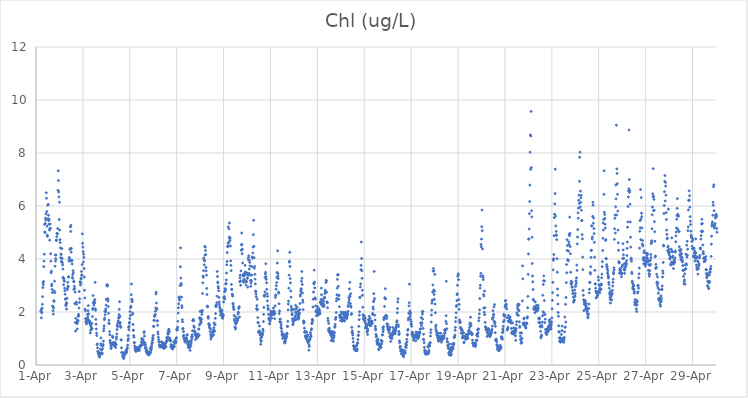
| Category | Chl (ug/L) |
|---|---|
| 44287.208333333336 | 2.02 |
| 44287.21875 | 2.05 |
| 44287.229166666664 | 1.78 |
| 44287.239583333336 | 2.12 |
| 44287.25 | 1.97 |
| 44287.260416666664 | 2.14 |
| 44287.270833333336 | 2.29 |
| 44287.28125 | 2.58 |
| 44287.291666666664 | 2.92 |
| 44287.302083333336 | 3.11 |
| 44287.3125 | 3.03 |
| 44287.322916666664 | 3.15 |
| 44287.333333333336 | 3.71 |
| 44287.34375 | 3.92 |
| 44287.354166666664 | 4.18 |
| 44287.364583333336 | 5.31 |
| 44287.375 | 5.02 |
| 44287.385416666664 | 5 |
| 44287.395833333336 | 5.34 |
| 44287.40625 | 5.54 |
| 44287.416666666664 | 5.47 |
| 44287.427083333336 | 5.7 |
| 44287.4375 | 6.5 |
| 44287.447916666664 | 6.29 |
| 44287.458333333336 | 5.79 |
| 44287.46875 | 5.24 |
| 44287.479166666664 | 4.9 |
| 44287.489583333336 | 4.85 |
| 44287.5 | 6.03 |
| 44287.510416666664 | 5.52 |
| 44287.520833333336 | 6.06 |
| 44287.53125 | 5.65 |
| 44287.541666666664 | 5.45 |
| 44287.552083333336 | 5.31 |
| 44287.5625 | 5.5 |
| 44287.572916666664 | 5.09 |
| 44287.583333333336 | 4.71 |
| 44287.59375 | 5.15 |
| 44287.604166666664 | 5.32 |
| 44287.614583333336 | 5.16 |
| 44287.625 | 4.2 |
| 44287.635416666664 | 3.92 |
| 44287.645833333336 | 3.48 |
| 44287.65625 | 3.54 |
| 44287.666666666664 | 2.99 |
| 44287.677083333336 | 3.05 |
| 44287.6875 | 2.85 |
| 44287.697916666664 | 2.73 |
| 44287.708333333336 | 2.22 |
| 44287.71875 | 2.21 |
| 44287.729166666664 | 2.05 |
| 44287.739583333336 | 1.92 |
| 44287.75 | 2.16 |
| 44287.760416666664 | 2.43 |
| 44287.770833333336 | 2.4 |
| 44287.78125 | 2.79 |
| 44287.791666666664 | 3.16 |
| 44287.802083333336 | 2.73 |
| 44287.8125 | 3.73 |
| 44287.822916666664 | 4.15 |
| 44287.833333333336 | 3.92 |
| 44287.84375 | 4.01 |
| 44287.854166666664 | 4.15 |
| 44287.864583333336 | 4.7 |
| 44287.875 | 4.71 |
| 44287.885416666664 | 4.84 |
| 44287.895833333336 | 4.97 |
| 44287.90625 | 4.96 |
| 44287.916666666664 | 4.95 |
| 44287.927083333336 | 5.15 |
| 44287.9375 | 6.59 |
| 44287.947916666664 | 7.33 |
| 44287.958333333336 | 6.96 |
| 44287.96875 | 6.53 |
| 44287.979166666664 | 6.34 |
| 44287.989583333336 | 5.49 |
| 44288.0 | 6.14 |
| 44288.010416666664 | 5.09 |
| 44288.020833333336 | 4.73 |
| 44288.03125 | 4.62 |
| 44288.041666666664 | 4.42 |
| 44288.052083333336 | 4.05 |
| 44288.0625 | 4.19 |
| 44288.072916666664 | 4.17 |
| 44288.083333333336 | 3.91 |
| 44288.09375 | 3.9 |
| 44288.104166666664 | 4.39 |
| 44288.114583333336 | 4.02 |
| 44288.125 | 3.86 |
| 44288.135416666664 | 3.78 |
| 44288.145833333336 | 3.62 |
| 44288.15625 | 3.31 |
| 44288.166666666664 | 3.27 |
| 44288.177083333336 | 3.03 |
| 44288.1875 | 3.26 |
| 44288.197916666664 | 3.2 |
| 44288.208333333336 | 3.16 |
| 44288.21875 | 2.9 |
| 44288.229166666664 | 2.8 |
| 44288.239583333336 | 2.67 |
| 44288.25 | 2.49 |
| 44288.260416666664 | 2.48 |
| 44288.270833333336 | 2.27 |
| 44288.28125 | 2.24 |
| 44288.291666666664 | 2.35 |
| 44288.302083333336 | 2.11 |
| 44288.3125 | 2.32 |
| 44288.322916666664 | 2.52 |
| 44288.333333333336 | 2.84 |
| 44288.34375 | 2.89 |
| 44288.354166666664 | 3.12 |
| 44288.364583333336 | 2.98 |
| 44288.375 | 2.96 |
| 44288.385416666664 | 3.32 |
| 44288.395833333336 | 3.33 |
| 44288.40625 | 3.94 |
| 44288.416666666664 | 4.06 |
| 44288.427083333336 | 3.92 |
| 44288.4375 | 4 |
| 44288.447916666664 | 4.36 |
| 44288.458333333336 | 4.39 |
| 44288.46875 | 5.21 |
| 44288.479166666664 | 5.04 |
| 44288.489583333336 | 5.27 |
| 44288.5 | 4.26 |
| 44288.510416666664 | 4.4 |
| 44288.520833333336 | 3.92 |
| 44288.53125 | 3.95 |
| 44288.541666666664 | 3.81 |
| 44288.552083333336 | 3.3 |
| 44288.5625 | 3.41 |
| 44288.572916666664 | 3.27 |
| 44288.583333333336 | 3.56 |
| 44288.59375 | 3.48 |
| 44288.604166666664 | 3.15 |
| 44288.614583333336 | 2.85 |
| 44288.625 | 3.15 |
| 44288.635416666664 | 2.97 |
| 44288.645833333336 | 2.89 |
| 44288.65625 | 2.31 |
| 44288.666666666664 | 2.75 |
| 44288.677083333336 | 1.6 |
| 44288.6875 | 1.28 |
| 44288.697916666664 | 1.76 |
| 44288.708333333336 | 2.36 |
| 44288.71875 | 2.37 |
| 44288.729166666664 | 2.29 |
| 44288.739583333336 | 1.61 |
| 44288.75 | 1.56 |
| 44288.760416666664 | 1.36 |
| 44288.770833333336 | 1.68 |
| 44288.78125 | 1.64 |
| 44288.791666666664 | 1.68 |
| 44288.802083333336 | 1.84 |
| 44288.8125 | 1.91 |
| 44288.822916666664 | 1.85 |
| 44288.833333333336 | 2.15 |
| 44288.84375 | 2.77 |
| 44288.854166666664 | 2.36 |
| 44288.864583333336 | 2.5 |
| 44288.875 | 3.13 |
| 44288.885416666664 | 3.14 |
| 44288.895833333336 | 3.02 |
| 44288.90625 | 3.1 |
| 44288.916666666664 | 3.25 |
| 44288.927083333336 | 3.27 |
| 44288.9375 | 3.53 |
| 44288.947916666664 | 3.39 |
| 44288.958333333336 | 3.39 |
| 44288.96875 | 3.79 |
| 44288.979166666664 | 4.95 |
| 44288.989583333336 | 4.59 |
| 44289.0 | 4.45 |
| 44289.010416666664 | 4.28 |
| 44289.020833333336 | 3.89 |
| 44289.03125 | 4.18 |
| 44289.041666666664 | 4.06 |
| 44289.052083333336 | 3.64 |
| 44289.0625 | 3.32 |
| 44289.072916666664 | 2.82 |
| 44289.083333333336 | 2.53 |
| 44289.09375 | 2.1 |
| 44289.104166666664 | 2.05 |
| 44289.114583333336 | 1.75 |
| 44289.125 | 1.62 |
| 44289.135416666664 | 1.74 |
| 44289.145833333336 | 1.68 |
| 44289.15625 | 1.55 |
| 44289.166666666664 | 1.63 |
| 44289.177083333336 | 1.68 |
| 44289.1875 | 1.91 |
| 44289.197916666664 | 1.74 |
| 44289.208333333336 | 1.81 |
| 44289.21875 | 2.05 |
| 44289.229166666664 | 2.24 |
| 44289.239583333336 | 1.93 |
| 44289.25 | 1.92 |
| 44289.260416666664 | 1.68 |
| 44289.270833333336 | 1.67 |
| 44289.28125 | 1.59 |
| 44289.291666666664 | 1.64 |
| 44289.302083333336 | 1.59 |
| 44289.3125 | 1.21 |
| 44289.322916666664 | 1.51 |
| 44289.333333333336 | 1.31 |
| 44289.34375 | 1.48 |
| 44289.354166666664 | 1.35 |
| 44289.364583333336 | 1.39 |
| 44289.375 | 1.4 |
| 44289.385416666664 | 1.57 |
| 44289.395833333336 | 1.37 |
| 44289.40625 | 1.83 |
| 44289.416666666664 | 2.1 |
| 44289.427083333336 | 2.14 |
| 44289.4375 | 2.62 |
| 44289.447916666664 | 2.33 |
| 44289.458333333336 | 2.36 |
| 44289.46875 | 2.26 |
| 44289.479166666664 | 2.41 |
| 44289.489583333336 | 2.37 |
| 44289.5 | 2.34 |
| 44289.510416666664 | 2.47 |
| 44289.520833333336 | 3.12 |
| 44289.53125 | 2.12 |
| 44289.541666666664 | 2.06 |
| 44289.552083333336 | 1.72 |
| 44289.5625 | 1.54 |
| 44289.572916666664 | 1.36 |
| 44289.583333333336 | 1.2 |
| 44289.59375 | 1.11 |
| 44289.604166666664 | 0.77 |
| 44289.614583333336 | 0.79 |
| 44289.625 | 0.65 |
| 44289.635416666664 | 0.52 |
| 44289.645833333336 | 0.5 |
| 44289.65625 | 0.43 |
| 44289.666666666664 | 0.48 |
| 44289.677083333336 | 0.48 |
| 44289.6875 | 0.34 |
| 44289.697916666664 | 0.37 |
| 44289.708333333336 | 0.3 |
| 44289.71875 | 0.35 |
| 44289.729166666664 | 0.39 |
| 44289.739583333336 | 0.44 |
| 44289.75 | 0.6 |
| 44289.760416666664 | 0.8 |
| 44289.770833333336 | 1.02 |
| 44289.78125 | 0.74 |
| 44289.791666666664 | 0.57 |
| 44289.802083333336 | 0.44 |
| 44289.8125 | 0.46 |
| 44289.822916666664 | 0.42 |
| 44289.833333333336 | 0.61 |
| 44289.84375 | 0.75 |
| 44289.854166666664 | 0.71 |
| 44289.864583333336 | 0.77 |
| 44289.875 | 0.9 |
| 44289.885416666664 | 1.29 |
| 44289.895833333336 | 1.38 |
| 44289.90625 | 1.48 |
| 44289.916666666664 | 1.71 |
| 44289.927083333336 | 1.77 |
| 44289.9375 | 2.03 |
| 44289.947916666664 | 1.9 |
| 44289.958333333336 | 2.05 |
| 44289.96875 | 2.01 |
| 44289.979166666664 | 2.12 |
| 44289.989583333336 | 2.26 |
| 44290.0 | 2.47 |
| 44290.010416666664 | 2.48 |
| 44290.020833333336 | 2.99 |
| 44290.03125 | 3.02 |
| 44290.041666666664 | 3.03 |
| 44290.052083333336 | 2.98 |
| 44290.0625 | 2.5 |
| 44290.072916666664 | 2.41 |
| 44290.083333333336 | 2.21 |
| 44290.09375 | 1.95 |
| 44290.104166666664 | 1.58 |
| 44290.114583333336 | 1.69 |
| 44290.125 | 1.56 |
| 44290.135416666664 | 1.26 |
| 44290.145833333336 | 1.14 |
| 44290.15625 | 0.93 |
| 44290.166666666664 | 0.86 |
| 44290.177083333336 | 0.82 |
| 44290.1875 | 0.74 |
| 44290.197916666664 | 0.62 |
| 44290.208333333336 | 0.66 |
| 44290.21875 | 0.78 |
| 44290.229166666664 | 0.74 |
| 44290.239583333336 | 0.83 |
| 44290.25 | 0.78 |
| 44290.260416666664 | 1.09 |
| 44290.270833333336 | 1.04 |
| 44290.28125 | 1.05 |
| 44290.291666666664 | 0.81 |
| 44290.302083333336 | 0.85 |
| 44290.3125 | 0.82 |
| 44290.322916666664 | 0.76 |
| 44290.333333333336 | 0.78 |
| 44290.34375 | 0.73 |
| 44290.354166666664 | 0.71 |
| 44290.364583333336 | 0.8 |
| 44290.375 | 0.86 |
| 44290.385416666664 | 0.79 |
| 44290.395833333336 | 0.66 |
| 44290.40625 | 0.77 |
| 44290.416666666664 | 0.77 |
| 44290.427083333336 | 0.98 |
| 44290.4375 | 1.06 |
| 44290.447916666664 | 1.17 |
| 44290.458333333336 | 1.34 |
| 44290.46875 | 1.5 |
| 44290.479166666664 | 1.45 |
| 44290.489583333336 | 1.57 |
| 44290.5 | 1.63 |
| 44290.510416666664 | 1.66 |
| 44290.520833333336 | 1.76 |
| 44290.53125 | 1.8 |
| 44290.541666666664 | 1.9 |
| 44290.552083333336 | 2.1 |
| 44290.5625 | 2.39 |
| 44290.572916666664 | 1.57 |
| 44290.583333333336 | 1.83 |
| 44290.59375 | 1.6 |
| 44290.604166666664 | 1.47 |
| 44290.614583333336 | 1.42 |
| 44290.625 | 0.95 |
| 44290.635416666664 | 0.94 |
| 44290.645833333336 | 0.65 |
| 44290.65625 | 0.46 |
| 44290.666666666664 | 0.48 |
| 44290.677083333336 | 0.47 |
| 44290.6875 | 0.47 |
| 44290.697916666664 | 0.35 |
| 44290.708333333336 | 0.31 |
| 44290.71875 | 0.36 |
| 44290.729166666664 | 0.33 |
| 44290.739583333336 | 0.24 |
| 44290.75 | 0.29 |
| 44290.760416666664 | 0.36 |
| 44290.770833333336 | 0.4 |
| 44290.78125 | 0.44 |
| 44290.791666666664 | 0.4 |
| 44290.802083333336 | 0.46 |
| 44290.8125 | 0.45 |
| 44290.822916666664 | 0.53 |
| 44290.833333333336 | 0.5 |
| 44290.84375 | 0.46 |
| 44290.854166666664 | 0.47 |
| 44290.864583333336 | 0.5 |
| 44290.875 | 0.57 |
| 44290.885416666664 | 0.62 |
| 44290.895833333336 | 0.66 |
| 44290.90625 | 0.75 |
| 44290.916666666664 | 0.92 |
| 44290.927083333336 | 1.11 |
| 44290.9375 | 0.99 |
| 44290.947916666664 | 1.42 |
| 44290.958333333336 | 1.33 |
| 44290.96875 | 1.46 |
| 44290.979166666664 | 1.58 |
| 44290.989583333336 | 1.61 |
| 44291.0 | 1.75 |
| 44291.010416666664 | 2.02 |
| 44291.020833333336 | 1.87 |
| 44291.03125 | 2.17 |
| 44291.041666666664 | 2.18 |
| 44291.052083333336 | 2.22 |
| 44291.0625 | 2.65 |
| 44291.072916666664 | 3.06 |
| 44291.083333333336 | 2.48 |
| 44291.09375 | 2.39 |
| 44291.104166666664 | 2.45 |
| 44291.114583333336 | 1.91 |
| 44291.125 | 1.96 |
| 44291.135416666664 | 1.53 |
| 44291.145833333336 | 1.31 |
| 44291.15625 | 1.31 |
| 44291.166666666664 | 1.11 |
| 44291.177083333336 | 1.05 |
| 44291.1875 | 0.84 |
| 44291.197916666664 | 0.85 |
| 44291.208333333336 | 0.72 |
| 44291.21875 | 0.64 |
| 44291.229166666664 | 0.58 |
| 44291.239583333336 | 0.56 |
| 44291.25 | 0.57 |
| 44291.260416666664 | 0.51 |
| 44291.270833333336 | 0.64 |
| 44291.28125 | 0.59 |
| 44291.291666666664 | 0.66 |
| 44291.302083333336 | 0.55 |
| 44291.3125 | 0.63 |
| 44291.322916666664 | 0.6 |
| 44291.333333333336 | 0.62 |
| 44291.34375 | 0.55 |
| 44291.354166666664 | 0.62 |
| 44291.364583333336 | 0.61 |
| 44291.375 | 0.67 |
| 44291.385416666664 | 0.55 |
| 44291.395833333336 | 0.59 |
| 44291.40625 | 0.55 |
| 44291.416666666664 | 0.65 |
| 44291.427083333336 | 0.68 |
| 44291.4375 | 0.7 |
| 44291.447916666664 | 0.73 |
| 44291.458333333336 | 0.72 |
| 44291.46875 | 0.72 |
| 44291.479166666664 | 0.72 |
| 44291.489583333336 | 0.77 |
| 44291.5 | 0.86 |
| 44291.510416666664 | 1 |
| 44291.520833333336 | 0.94 |
| 44291.53125 | 0.9 |
| 44291.541666666664 | 0.97 |
| 44291.552083333336 | 0.77 |
| 44291.5625 | 0.85 |
| 44291.572916666664 | 0.96 |
| 44291.583333333336 | 0.86 |
| 44291.59375 | 0.86 |
| 44291.604166666664 | 1.21 |
| 44291.614583333336 | 1.26 |
| 44291.625 | 1.09 |
| 44291.635416666664 | 0.85 |
| 44291.645833333336 | 0.74 |
| 44291.65625 | 0.63 |
| 44291.666666666664 | 0.78 |
| 44291.677083333336 | 0.66 |
| 44291.6875 | 0.66 |
| 44291.697916666664 | 0.52 |
| 44291.708333333336 | 0.55 |
| 44291.71875 | 0.48 |
| 44291.729166666664 | 0.57 |
| 44291.739583333336 | 0.44 |
| 44291.75 | 0.5 |
| 44291.760416666664 | 0.43 |
| 44291.770833333336 | 0.46 |
| 44291.78125 | 0.49 |
| 44291.791666666664 | 0.39 |
| 44291.802083333336 | 0.41 |
| 44291.8125 | 0.38 |
| 44291.822916666664 | 0.47 |
| 44291.833333333336 | 0.48 |
| 44291.84375 | 0.42 |
| 44291.854166666664 | 0.47 |
| 44291.864583333336 | 0.44 |
| 44291.875 | 0.65 |
| 44291.885416666664 | 0.49 |
| 44291.895833333336 | 0.58 |
| 44291.90625 | 0.57 |
| 44291.916666666664 | 0.61 |
| 44291.927083333336 | 0.67 |
| 44291.9375 | 0.75 |
| 44291.947916666664 | 0.82 |
| 44291.958333333336 | 0.85 |
| 44291.96875 | 0.93 |
| 44291.979166666664 | 1.04 |
| 44291.989583333336 | 1 |
| 44292.0 | 1.12 |
| 44292.010416666664 | 1.46 |
| 44292.020833333336 | 1.45 |
| 44292.03125 | 1.68 |
| 44292.041666666664 | 1.69 |
| 44292.052083333336 | 1.85 |
| 44292.0625 | 1.84 |
| 44292.072916666664 | 1.86 |
| 44292.083333333336 | 1.91 |
| 44292.09375 | 2.03 |
| 44292.104166666664 | 2.15 |
| 44292.114583333336 | 2.68 |
| 44292.125 | 2.74 |
| 44292.135416666664 | 2.34 |
| 44292.145833333336 | 2.14 |
| 44292.15625 | 2.1 |
| 44292.166666666664 | 1.66 |
| 44292.177083333336 | 1.67 |
| 44292.1875 | 1.5 |
| 44292.197916666664 | 1.25 |
| 44292.208333333336 | 1.17 |
| 44292.21875 | 1.05 |
| 44292.229166666664 | 0.96 |
| 44292.239583333336 | 0.87 |
| 44292.25 | 0.87 |
| 44292.260416666664 | 0.76 |
| 44292.270833333336 | 0.73 |
| 44292.28125 | 0.68 |
| 44292.291666666664 | 0.73 |
| 44292.302083333336 | 0.71 |
| 44292.3125 | 0.69 |
| 44292.322916666664 | 0.68 |
| 44292.333333333336 | 0.74 |
| 44292.34375 | 0.73 |
| 44292.354166666664 | 0.88 |
| 44292.364583333336 | 0.85 |
| 44292.375 | 0.72 |
| 44292.385416666664 | 0.78 |
| 44292.395833333336 | 0.68 |
| 44292.40625 | 0.72 |
| 44292.416666666664 | 0.66 |
| 44292.427083333336 | 0.74 |
| 44292.4375 | 0.83 |
| 44292.447916666664 | 0.81 |
| 44292.458333333336 | 0.63 |
| 44292.46875 | 0.63 |
| 44292.479166666664 | 0.69 |
| 44292.489583333336 | 0.79 |
| 44292.5 | 0.7 |
| 44292.510416666664 | 0.7 |
| 44292.520833333336 | 0.81 |
| 44292.53125 | 0.68 |
| 44292.541666666664 | 0.71 |
| 44292.552083333336 | 0.86 |
| 44292.5625 | 0.91 |
| 44292.572916666664 | 1.02 |
| 44292.583333333336 | 1.03 |
| 44292.59375 | 0.92 |
| 44292.604166666664 | 0.93 |
| 44292.614583333336 | 1.18 |
| 44292.625 | 1.06 |
| 44292.635416666664 | 1.24 |
| 44292.645833333336 | 1.17 |
| 44292.65625 | 1.31 |
| 44292.666666666664 | 1.35 |
| 44292.677083333336 | 1.27 |
| 44292.6875 | 1.26 |
| 44292.697916666664 | 0.98 |
| 44292.708333333336 | 1.01 |
| 44292.71875 | 0.95 |
| 44292.729166666664 | 0.9 |
| 44292.739583333336 | 0.92 |
| 44292.75 | 0.68 |
| 44292.760416666664 | 0.77 |
| 44292.770833333336 | 0.71 |
| 44292.78125 | 0.71 |
| 44292.791666666664 | 0.72 |
| 44292.802083333336 | 0.68 |
| 44292.8125 | 0.63 |
| 44292.822916666664 | 0.6 |
| 44292.833333333336 | 0.65 |
| 44292.84375 | 0.65 |
| 44292.854166666664 | 0.75 |
| 44292.864583333336 | 0.73 |
| 44292.875 | 0.86 |
| 44292.885416666664 | 0.71 |
| 44292.895833333336 | 0.69 |
| 44292.90625 | 0.86 |
| 44292.916666666664 | 0.88 |
| 44292.927083333336 | 0.93 |
| 44292.9375 | 0.89 |
| 44292.947916666664 | 0.82 |
| 44292.958333333336 | 0.87 |
| 44292.96875 | 0.88 |
| 44292.979166666664 | 1.01 |
| 44292.989583333336 | 1.03 |
| 44293.0 | 1.33 |
| 44293.010416666664 | 1.36 |
| 44293.020833333336 | 1.32 |
| 44293.03125 | 1.34 |
| 44293.041666666664 | 1.43 |
| 44293.052083333336 | 1.65 |
| 44293.0625 | 1.96 |
| 44293.072916666664 | 2.16 |
| 44293.083333333336 | 2.31 |
| 44293.09375 | 2.55 |
| 44293.104166666664 | 2.53 |
| 44293.114583333336 | 2.57 |
| 44293.125 | 2.46 |
| 44293.135416666664 | 2.45 |
| 44293.145833333336 | 3 |
| 44293.15625 | 3.71 |
| 44293.166666666664 | 4.42 |
| 44293.177083333336 | 3.28 |
| 44293.1875 | 3.08 |
| 44293.197916666664 | 3.02 |
| 44293.208333333336 | 2.56 |
| 44293.21875 | 2.24 |
| 44293.229166666664 | 2.17 |
| 44293.239583333336 | 1.71 |
| 44293.25 | 1.63 |
| 44293.260416666664 | 1.36 |
| 44293.270833333336 | 1.38 |
| 44293.28125 | 1.09 |
| 44293.291666666664 | 1.26 |
| 44293.302083333336 | 1.12 |
| 44293.3125 | 1.02 |
| 44293.322916666664 | 1 |
| 44293.333333333336 | 0.97 |
| 44293.34375 | 0.91 |
| 44293.354166666664 | 0.91 |
| 44293.364583333336 | 0.86 |
| 44293.375 | 0.92 |
| 44293.385416666664 | 0.9 |
| 44293.395833333336 | 0.95 |
| 44293.40625 | 1.03 |
| 44293.416666666664 | 0.96 |
| 44293.427083333336 | 0.98 |
| 44293.4375 | 1.12 |
| 44293.447916666664 | 1.15 |
| 44293.458333333336 | 0.89 |
| 44293.46875 | 0.8 |
| 44293.479166666664 | 0.77 |
| 44293.489583333336 | 0.67 |
| 44293.5 | 0.77 |
| 44293.510416666664 | 0.85 |
| 44293.520833333336 | 0.65 |
| 44293.53125 | 0.76 |
| 44293.541666666664 | 0.89 |
| 44293.552083333336 | 0.69 |
| 44293.5625 | 0.66 |
| 44293.572916666664 | 0.55 |
| 44293.583333333336 | 0.77 |
| 44293.59375 | 0.9 |
| 44293.604166666664 | 0.73 |
| 44293.614583333336 | 0.83 |
| 44293.625 | 0.9 |
| 44293.635416666664 | 1.06 |
| 44293.645833333336 | 0.99 |
| 44293.65625 | 1.14 |
| 44293.666666666664 | 1.07 |
| 44293.677083333336 | 1.29 |
| 44293.6875 | 1.68 |
| 44293.697916666664 | 1.68 |
| 44293.708333333336 | 1.72 |
| 44293.71875 | 1.67 |
| 44293.729166666664 | 1.47 |
| 44293.739583333336 | 1.29 |
| 44293.75 | 1.42 |
| 44293.760416666664 | 1.26 |
| 44293.770833333336 | 1.28 |
| 44293.78125 | 1.16 |
| 44293.791666666664 | 1.13 |
| 44293.802083333336 | 0.96 |
| 44293.8125 | 1.19 |
| 44293.822916666664 | 1.17 |
| 44293.833333333336 | 1.06 |
| 44293.84375 | 1.06 |
| 44293.854166666664 | 1.14 |
| 44293.864583333336 | 1.03 |
| 44293.875 | 1.1 |
| 44293.885416666664 | 1.03 |
| 44293.895833333336 | 1.11 |
| 44293.90625 | 1.17 |
| 44293.916666666664 | 1.16 |
| 44293.927083333336 | 1.1 |
| 44293.9375 | 1.35 |
| 44293.947916666664 | 1.36 |
| 44293.958333333336 | 1.12 |
| 44293.96875 | 1.78 |
| 44293.979166666664 | 1.51 |
| 44293.989583333336 | 1.55 |
| 44294.0 | 2.02 |
| 44294.010416666664 | 1.71 |
| 44294.020833333336 | 1.77 |
| 44294.03125 | 1.65 |
| 44294.041666666664 | 1.6 |
| 44294.052083333336 | 2.03 |
| 44294.0625 | 1.72 |
| 44294.072916666664 | 1.91 |
| 44294.083333333336 | 2 |
| 44294.09375 | 2.06 |
| 44294.104166666664 | 2.7 |
| 44294.114583333336 | 3.1 |
| 44294.125 | 3.36 |
| 44294.135416666664 | 3.31 |
| 44294.145833333336 | 3.56 |
| 44294.15625 | 4.04 |
| 44294.166666666664 | 3.98 |
| 44294.177083333336 | 3.78 |
| 44294.1875 | 3.93 |
| 44294.197916666664 | 4.47 |
| 44294.208333333336 | 4.15 |
| 44294.21875 | 4.45 |
| 44294.229166666664 | 4.32 |
| 44294.239583333336 | 4.17 |
| 44294.25 | 3.68 |
| 44294.260416666664 | 3.55 |
| 44294.270833333336 | 3.39 |
| 44294.28125 | 2.89 |
| 44294.291666666664 | 2.66 |
| 44294.302083333336 | 2.22 |
| 44294.3125 | 2.21 |
| 44294.322916666664 | 2.19 |
| 44294.333333333336 | 1.82 |
| 44294.34375 | 1.76 |
| 44294.354166666664 | 1.82 |
| 44294.364583333336 | 1.56 |
| 44294.375 | 1.54 |
| 44294.385416666664 | 1.48 |
| 44294.395833333336 | 1.43 |
| 44294.40625 | 1.52 |
| 44294.416666666664 | 1.37 |
| 44294.427083333336 | 1.26 |
| 44294.4375 | 1.37 |
| 44294.447916666664 | 1.15 |
| 44294.458333333336 | 0.98 |
| 44294.46875 | 1.07 |
| 44294.479166666664 | 1.1 |
| 44294.489583333336 | 1.07 |
| 44294.5 | 1.08 |
| 44294.510416666664 | 1.13 |
| 44294.520833333336 | 1.11 |
| 44294.53125 | 1.24 |
| 44294.541666666664 | 1.23 |
| 44294.552083333336 | 1.3 |
| 44294.5625 | 1.33 |
| 44294.572916666664 | 1.14 |
| 44294.583333333336 | 1.41 |
| 44294.59375 | 1.59 |
| 44294.604166666664 | 1.26 |
| 44294.614583333336 | 1.3 |
| 44294.625 | 1.53 |
| 44294.635416666664 | 1.52 |
| 44294.645833333336 | 1.76 |
| 44294.65625 | 1.94 |
| 44294.666666666664 | 2.23 |
| 44294.677083333336 | 2.2 |
| 44294.6875 | 2.26 |
| 44294.697916666664 | 2.25 |
| 44294.708333333336 | 2.35 |
| 44294.71875 | 2.6 |
| 44294.729166666664 | 3.53 |
| 44294.739583333336 | 3.34 |
| 44294.75 | 3.13 |
| 44294.760416666664 | 3.1 |
| 44294.770833333336 | 2.96 |
| 44294.78125 | 2.9 |
| 44294.791666666664 | 2.8 |
| 44294.802083333336 | 2.55 |
| 44294.8125 | 2.38 |
| 44294.822916666664 | 2.29 |
| 44294.833333333336 | 2.2 |
| 44294.84375 | 2.14 |
| 44294.854166666664 | 2.05 |
| 44294.864583333336 | 2.03 |
| 44294.875 | 1.88 |
| 44294.885416666664 | 1.97 |
| 44294.895833333336 | 1.9 |
| 44294.90625 | 2 |
| 44294.916666666664 | 2.07 |
| 44294.927083333336 | 2.05 |
| 44294.9375 | 1.9 |
| 44294.947916666664 | 1.81 |
| 44294.958333333336 | 1.76 |
| 44294.96875 | 1.92 |
| 44294.979166666664 | 1.84 |
| 44294.989583333336 | 1.88 |
| 44295.0 | 2.38 |
| 44295.010416666664 | 2.53 |
| 44295.020833333336 | 2.56 |
| 44295.03125 | 2.58 |
| 44295.041666666664 | 2.76 |
| 44295.052083333336 | 2.49 |
| 44295.0625 | 2.88 |
| 44295.072916666664 | 2.8 |
| 44295.083333333336 | 2.87 |
| 44295.09375 | 3.05 |
| 44295.104166666664 | 3.08 |
| 44295.114583333336 | 3.21 |
| 44295.125 | 3.47 |
| 44295.135416666664 | 3.78 |
| 44295.145833333336 | 3.91 |
| 44295.15625 | 4.24 |
| 44295.166666666664 | 4.47 |
| 44295.177083333336 | 4.47 |
| 44295.1875 | 4.6 |
| 44295.197916666664 | 5.21 |
| 44295.208333333336 | 4.5 |
| 44295.21875 | 4.62 |
| 44295.229166666664 | 5.14 |
| 44295.239583333336 | 4.83 |
| 44295.25 | 5.36 |
| 44295.260416666664 | 4.77 |
| 44295.270833333336 | 4.69 |
| 44295.28125 | 4.79 |
| 44295.291666666664 | 4.49 |
| 44295.302083333336 | 3.93 |
| 44295.3125 | 3.76 |
| 44295.322916666664 | 3.56 |
| 44295.333333333336 | 3.04 |
| 44295.34375 | 2.85 |
| 44295.354166666664 | 2.86 |
| 44295.364583333336 | 2.68 |
| 44295.375 | 2.65 |
| 44295.385416666664 | 2.6 |
| 44295.395833333336 | 2.32 |
| 44295.40625 | 2.3 |
| 44295.416666666664 | 2.21 |
| 44295.427083333336 | 2.15 |
| 44295.4375 | 2.09 |
| 44295.447916666664 | 1.87 |
| 44295.458333333336 | 1.73 |
| 44295.46875 | 1.67 |
| 44295.479166666664 | 1.43 |
| 44295.489583333336 | 1.61 |
| 44295.5 | 1.43 |
| 44295.510416666664 | 1.36 |
| 44295.520833333336 | 1.55 |
| 44295.53125 | 1.81 |
| 44295.541666666664 | 1.62 |
| 44295.552083333336 | 1.58 |
| 44295.5625 | 1.63 |
| 44295.572916666664 | 1.73 |
| 44295.583333333336 | 1.67 |
| 44295.59375 | 1.69 |
| 44295.604166666664 | 1.74 |
| 44295.614583333336 | 1.92 |
| 44295.625 | 1.99 |
| 44295.635416666664 | 1.98 |
| 44295.645833333336 | 2.13 |
| 44295.65625 | 2.18 |
| 44295.666666666664 | 2.2 |
| 44295.677083333336 | 1.81 |
| 44295.6875 | 3.14 |
| 44295.697916666664 | 3.29 |
| 44295.708333333336 | 3.39 |
| 44295.71875 | 3.17 |
| 44295.729166666664 | 3.01 |
| 44295.739583333336 | 3.55 |
| 44295.75 | 4.33 |
| 44295.760416666664 | 4.53 |
| 44295.770833333336 | 4.98 |
| 44295.78125 | 4.55 |
| 44295.791666666664 | 4.2 |
| 44295.802083333336 | 4.37 |
| 44295.8125 | 3.85 |
| 44295.822916666664 | 3.37 |
| 44295.833333333336 | 3.17 |
| 44295.84375 | 3.42 |
| 44295.854166666664 | 3.12 |
| 44295.864583333336 | 3.24 |
| 44295.875 | 3.36 |
| 44295.885416666664 | 3.43 |
| 44295.895833333336 | 3.46 |
| 44295.90625 | 3.41 |
| 44295.916666666664 | 3.76 |
| 44295.927083333336 | 3.51 |
| 44295.9375 | 3.18 |
| 44295.947916666664 | 3.14 |
| 44295.958333333336 | 3.02 |
| 44295.96875 | 3.16 |
| 44295.979166666664 | 3.14 |
| 44295.989583333336 | 3.45 |
| 44296.0 | 3.28 |
| 44296.010416666664 | 3.47 |
| 44296.020833333336 | 3.27 |
| 44296.03125 | 2.94 |
| 44296.041666666664 | 3.38 |
| 44296.052083333336 | 4.05 |
| 44296.0625 | 3.97 |
| 44296.072916666664 | 4.12 |
| 44296.083333333336 | 3.46 |
| 44296.09375 | 3.62 |
| 44296.104166666664 | 3.95 |
| 44296.114583333336 | 3.87 |
| 44296.125 | 3.74 |
| 44296.135416666664 | 3.39 |
| 44296.145833333336 | 3.19 |
| 44296.15625 | 2.97 |
| 44296.166666666664 | 3.09 |
| 44296.177083333336 | 3.19 |
| 44296.1875 | 3.17 |
| 44296.197916666664 | 3.4 |
| 44296.208333333336 | 3.71 |
| 44296.21875 | 4.08 |
| 44296.229166666664 | 4.04 |
| 44296.239583333336 | 4.04 |
| 44296.25 | 4.23 |
| 44296.260416666664 | 4.45 |
| 44296.270833333336 | 4.92 |
| 44296.28125 | 5.46 |
| 44296.291666666664 | 4.48 |
| 44296.302083333336 | 4.05 |
| 44296.3125 | 3.65 |
| 44296.322916666664 | 3.72 |
| 44296.333333333336 | 3.42 |
| 44296.34375 | 3.24 |
| 44296.354166666664 | 3.06 |
| 44296.364583333336 | 2.79 |
| 44296.375 | 2.76 |
| 44296.385416666664 | 2.67 |
| 44296.395833333336 | 2.57 |
| 44296.40625 | 2.13 |
| 44296.416666666664 | 2.24 |
| 44296.427083333336 | 2.08 |
| 44296.4375 | 2.48 |
| 44296.447916666664 | 2.1 |
| 44296.458333333336 | 1.79 |
| 44296.46875 | 1.61 |
| 44296.479166666664 | 1.59 |
| 44296.489583333336 | 1.24 |
| 44296.5 | 1.25 |
| 44296.510416666664 | 1.28 |
| 44296.520833333336 | 1.28 |
| 44296.53125 | 1.47 |
| 44296.541666666664 | 1.27 |
| 44296.552083333336 | 1.14 |
| 44296.5625 | 1.2 |
| 44296.572916666664 | 1 |
| 44296.583333333336 | 0.78 |
| 44296.59375 | 0.89 |
| 44296.604166666664 | 0.92 |
| 44296.614583333336 | 1.06 |
| 44296.625 | 1.06 |
| 44296.635416666664 | 1.19 |
| 44296.645833333336 | 1.18 |
| 44296.65625 | 1.13 |
| 44296.666666666664 | 1.18 |
| 44296.677083333336 | 1.35 |
| 44296.6875 | 1.28 |
| 44296.697916666664 | 1.64 |
| 44296.708333333336 | 1.91 |
| 44296.71875 | 2.17 |
| 44296.729166666664 | 2.62 |
| 44296.739583333336 | 2.59 |
| 44296.75 | 2.64 |
| 44296.760416666664 | 2.76 |
| 44296.770833333336 | 3.3 |
| 44296.78125 | 3.43 |
| 44296.791666666664 | 3.5 |
| 44296.802083333336 | 3.82 |
| 44296.8125 | 3.33 |
| 44296.822916666664 | 3.23 |
| 44296.833333333336 | 3.1 |
| 44296.84375 | 2.86 |
| 44296.854166666664 | 2.69 |
| 44296.864583333336 | 2.42 |
| 44296.875 | 2.59 |
| 44296.885416666664 | 2.24 |
| 44296.895833333336 | 2.14 |
| 44296.90625 | 2.09 |
| 44296.916666666664 | 1.91 |
| 44296.927083333336 | 1.77 |
| 44296.9375 | 1.73 |
| 44296.947916666664 | 1.7 |
| 44296.958333333336 | 1.56 |
| 44296.96875 | 1.56 |
| 44296.979166666664 | 1.73 |
| 44296.989583333336 | 1.66 |
| 44297.0 | 1.94 |
| 44297.010416666664 | 1.85 |
| 44297.020833333336 | 2.03 |
| 44297.03125 | 2 |
| 44297.041666666664 | 1.93 |
| 44297.052083333336 | 1.77 |
| 44297.0625 | 1.89 |
| 44297.072916666664 | 1.96 |
| 44297.083333333336 | 1.97 |
| 44297.09375 | 2.02 |
| 44297.104166666664 | 1.97 |
| 44297.114583333336 | 1.91 |
| 44297.125 | 2.15 |
| 44297.135416666664 | 1.99 |
| 44297.145833333336 | 1.9 |
| 44297.15625 | 2.03 |
| 44297.166666666664 | 2 |
| 44297.177083333336 | 1.75 |
| 44297.1875 | 1.94 |
| 44297.197916666664 | 2.23 |
| 44297.208333333336 | 2.55 |
| 44297.21875 | 2.62 |
| 44297.229166666664 | 2.64 |
| 44297.239583333336 | 2.86 |
| 44297.25 | 2.99 |
| 44297.260416666664 | 3.11 |
| 44297.270833333336 | 3.3 |
| 44297.28125 | 3.49 |
| 44297.291666666664 | 3.85 |
| 44297.302083333336 | 4.31 |
| 44297.3125 | 3.45 |
| 44297.322916666664 | 3.36 |
| 44297.333333333336 | 3.26 |
| 44297.34375 | 2.75 |
| 44297.354166666664 | 2.71 |
| 44297.364583333336 | 2.31 |
| 44297.375 | 1.94 |
| 44297.385416666664 | 2.04 |
| 44297.395833333336 | 1.63 |
| 44297.40625 | 1.73 |
| 44297.416666666664 | 1.73 |
| 44297.427083333336 | 1.62 |
| 44297.4375 | 1.6 |
| 44297.447916666664 | 1.43 |
| 44297.458333333336 | 1.51 |
| 44297.46875 | 1.37 |
| 44297.479166666664 | 1.26 |
| 44297.489583333336 | 1.16 |
| 44297.5 | 1.14 |
| 44297.510416666664 | 1.11 |
| 44297.520833333336 | 1 |
| 44297.53125 | 1.18 |
| 44297.541666666664 | 1.14 |
| 44297.552083333336 | 1.1 |
| 44297.5625 | 1.04 |
| 44297.572916666664 | 1.14 |
| 44297.583333333336 | 1.09 |
| 44297.59375 | 0.88 |
| 44297.604166666664 | 0.84 |
| 44297.614583333336 | 0.83 |
| 44297.625 | 1.01 |
| 44297.635416666664 | 0.89 |
| 44297.645833333336 | 0.96 |
| 44297.65625 | 1.03 |
| 44297.666666666664 | 1.02 |
| 44297.677083333336 | 1.13 |
| 44297.6875 | 1.07 |
| 44297.697916666664 | 1.2 |
| 44297.708333333336 | 1.18 |
| 44297.71875 | 1.46 |
| 44297.729166666664 | 1.45 |
| 44297.739583333336 | 1.65 |
| 44297.75 | 2.08 |
| 44297.760416666664 | 2.3 |
| 44297.770833333336 | 2.41 |
| 44297.78125 | 2.9 |
| 44297.791666666664 | 3.39 |
| 44297.802083333336 | 3.88 |
| 44297.8125 | 3.92 |
| 44297.822916666664 | 4.25 |
| 44297.833333333336 | 3.72 |
| 44297.84375 | 3.26 |
| 44297.854166666664 | 3.1 |
| 44297.864583333336 | 2.79 |
| 44297.875 | 2.56 |
| 44297.885416666664 | 2.21 |
| 44297.895833333336 | 2.06 |
| 44297.90625 | 2.13 |
| 44297.916666666664 | 1.9 |
| 44297.927083333336 | 1.94 |
| 44297.9375 | 1.75 |
| 44297.947916666664 | 1.66 |
| 44297.958333333336 | 1.52 |
| 44297.96875 | 1.58 |
| 44297.979166666664 | 1.66 |
| 44297.989583333336 | 2.09 |
| 44298.0 | 1.71 |
| 44298.010416666664 | 1.68 |
| 44298.020833333336 | 1.68 |
| 44298.03125 | 1.71 |
| 44298.041666666664 | 1.81 |
| 44298.052083333336 | 1.86 |
| 44298.0625 | 1.99 |
| 44298.072916666664 | 2.25 |
| 44298.083333333336 | 2.12 |
| 44298.09375 | 2.11 |
| 44298.104166666664 | 1.72 |
| 44298.114583333336 | 1.75 |
| 44298.125 | 1.93 |
| 44298.135416666664 | 2.18 |
| 44298.145833333336 | 2 |
| 44298.15625 | 1.86 |
| 44298.166666666664 | 1.98 |
| 44298.177083333336 | 1.8 |
| 44298.1875 | 1.9 |
| 44298.197916666664 | 1.73 |
| 44298.208333333336 | 2.05 |
| 44298.21875 | 1.81 |
| 44298.229166666664 | 1.91 |
| 44298.239583333336 | 1.96 |
| 44298.25 | 2.09 |
| 44298.260416666664 | 2.32 |
| 44298.270833333336 | 2.6 |
| 44298.28125 | 2.66 |
| 44298.291666666664 | 2.78 |
| 44298.302083333336 | 2.84 |
| 44298.3125 | 2.88 |
| 44298.322916666664 | 3.16 |
| 44298.333333333336 | 3.53 |
| 44298.34375 | 3.27 |
| 44298.354166666664 | 3.04 |
| 44298.364583333336 | 2.72 |
| 44298.375 | 2.45 |
| 44298.385416666664 | 2.37 |
| 44298.395833333336 | 2.09 |
| 44298.40625 | 1.66 |
| 44298.416666666664 | 1.58 |
| 44298.427083333336 | 1.64 |
| 44298.4375 | 1.61 |
| 44298.447916666664 | 1.39 |
| 44298.458333333336 | 1.24 |
| 44298.46875 | 1.27 |
| 44298.479166666664 | 1.23 |
| 44298.489583333336 | 1.1 |
| 44298.5 | 1.05 |
| 44298.510416666664 | 1.06 |
| 44298.520833333336 | 0.99 |
| 44298.53125 | 1.09 |
| 44298.541666666664 | 1.25 |
| 44298.552083333336 | 1.04 |
| 44298.5625 | 0.91 |
| 44298.572916666664 | 1.13 |
| 44298.583333333336 | 1.13 |
| 44298.59375 | 1.1 |
| 44298.604166666664 | 0.84 |
| 44298.614583333336 | 0.94 |
| 44298.625 | 0.86 |
| 44298.635416666664 | 0.56 |
| 44298.645833333336 | 0.76 |
| 44298.65625 | 0.7 |
| 44298.666666666664 | 0.96 |
| 44298.677083333336 | 0.94 |
| 44298.6875 | 0.99 |
| 44298.697916666664 | 1.22 |
| 44298.708333333336 | 1.07 |
| 44298.71875 | 1.15 |
| 44298.729166666664 | 1.08 |
| 44298.739583333336 | 1.32 |
| 44298.75 | 1.37 |
| 44298.760416666664 | 1.58 |
| 44298.770833333336 | 1.56 |
| 44298.78125 | 1.7 |
| 44298.791666666664 | 1.72 |
| 44298.802083333336 | 1.65 |
| 44298.8125 | 2.19 |
| 44298.822916666664 | 2.48 |
| 44298.833333333336 | 2.75 |
| 44298.84375 | 3.08 |
| 44298.854166666664 | 3.06 |
| 44298.864583333336 | 3.58 |
| 44298.875 | 3.13 |
| 44298.885416666664 | 2.91 |
| 44298.895833333336 | 2.53 |
| 44298.90625 | 2.52 |
| 44298.916666666664 | 2.49 |
| 44298.927083333336 | 2.23 |
| 44298.9375 | 2.04 |
| 44298.947916666664 | 2.01 |
| 44298.958333333336 | 1.86 |
| 44298.96875 | 2.02 |
| 44298.979166666664 | 1.97 |
| 44298.989583333336 | 2.07 |
| 44299.0 | 2.11 |
| 44299.010416666664 | 2.2 |
| 44299.020833333336 | 1.99 |
| 44299.03125 | 2.08 |
| 44299.041666666664 | 1.89 |
| 44299.052083333336 | 1.9 |
| 44299.0625 | 1.95 |
| 44299.072916666664 | 2.12 |
| 44299.083333333336 | 1.95 |
| 44299.09375 | 1.97 |
| 44299.104166666664 | 2.05 |
| 44299.114583333336 | 1.94 |
| 44299.125 | 2.38 |
| 44299.135416666664 | 2.37 |
| 44299.145833333336 | 2.31 |
| 44299.15625 | 2.47 |
| 44299.166666666664 | 2.9 |
| 44299.177083333336 | 2.65 |
| 44299.1875 | 2.37 |
| 44299.197916666664 | 2.29 |
| 44299.208333333336 | 2.24 |
| 44299.21875 | 2.24 |
| 44299.229166666664 | 2.48 |
| 44299.239583333336 | 2.41 |
| 44299.25 | 2.21 |
| 44299.260416666664 | 2.29 |
| 44299.270833333336 | 2.4 |
| 44299.28125 | 2.27 |
| 44299.291666666664 | 2.22 |
| 44299.302083333336 | 2.56 |
| 44299.3125 | 2.53 |
| 44299.322916666664 | 2.7 |
| 44299.333333333336 | 2.82 |
| 44299.34375 | 2.75 |
| 44299.354166666664 | 2.75 |
| 44299.364583333336 | 3.11 |
| 44299.375 | 3.2 |
| 44299.385416666664 | 3.17 |
| 44299.395833333336 | 2.75 |
| 44299.40625 | 2.38 |
| 44299.416666666664 | 2.37 |
| 44299.427083333336 | 2.35 |
| 44299.4375 | 2.16 |
| 44299.447916666664 | 1.76 |
| 44299.458333333336 | 1.67 |
| 44299.46875 | 1.34 |
| 44299.479166666664 | 1.57 |
| 44299.489583333336 | 1.26 |
| 44299.5 | 1.29 |
| 44299.510416666664 | 1.39 |
| 44299.520833333336 | 1.26 |
| 44299.53125 | 1.3 |
| 44299.541666666664 | 1.21 |
| 44299.552083333336 | 1.2 |
| 44299.5625 | 1.14 |
| 44299.572916666664 | 1.23 |
| 44299.583333333336 | 1.26 |
| 44299.59375 | 0.92 |
| 44299.604166666664 | 1.09 |
| 44299.614583333336 | 0.94 |
| 44299.625 | 1.05 |
| 44299.635416666664 | 1.16 |
| 44299.645833333336 | 1.11 |
| 44299.65625 | 1.19 |
| 44299.666666666664 | 0.99 |
| 44299.677083333336 | 1.26 |
| 44299.6875 | 0.9 |
| 44299.697916666664 | 1.03 |
| 44299.708333333336 | 1.2 |
| 44299.71875 | 1.1 |
| 44299.729166666664 | 1.22 |
| 44299.739583333336 | 1.42 |
| 44299.75 | 1.45 |
| 44299.760416666664 | 1.53 |
| 44299.770833333336 | 1.72 |
| 44299.78125 | 1.79 |
| 44299.791666666664 | 1.79 |
| 44299.802083333336 | 1.98 |
| 44299.8125 | 2.42 |
| 44299.822916666664 | 2.51 |
| 44299.833333333336 | 2.65 |
| 44299.84375 | 2.9 |
| 44299.854166666664 | 3.23 |
| 44299.864583333336 | 3.39 |
| 44299.875 | 3.41 |
| 44299.885416666664 | 3.41 |
| 44299.895833333336 | 2.97 |
| 44299.90625 | 2.61 |
| 44299.916666666664 | 2.48 |
| 44299.927083333336 | 2.63 |
| 44299.9375 | 2.2 |
| 44299.947916666664 | 1.88 |
| 44299.958333333336 | 1.85 |
| 44299.96875 | 1.8 |
| 44299.979166666664 | 1.8 |
| 44299.989583333336 | 1.68 |
| 44300.0 | 1.8 |
| 44300.010416666664 | 1.91 |
| 44300.020833333336 | 2 |
| 44300.03125 | 1.67 |
| 44300.041666666664 | 1.74 |
| 44300.052083333336 | 1.79 |
| 44300.0625 | 1.65 |
| 44300.072916666664 | 1.73 |
| 44300.083333333336 | 1.72 |
| 44300.09375 | 1.7 |
| 44300.104166666664 | 1.93 |
| 44300.114583333336 | 1.99 |
| 44300.125 | 1.97 |
| 44300.135416666664 | 1.85 |
| 44300.145833333336 | 1.68 |
| 44300.15625 | 1.66 |
| 44300.166666666664 | 1.78 |
| 44300.177083333336 | 1.94 |
| 44300.1875 | 1.99 |
| 44300.197916666664 | 1.78 |
| 44300.208333333336 | 1.79 |
| 44300.21875 | 1.89 |
| 44300.229166666664 | 1.82 |
| 44300.239583333336 | 1.78 |
| 44300.25 | 1.75 |
| 44300.260416666664 | 1.8 |
| 44300.270833333336 | 1.92 |
| 44300.28125 | 1.96 |
| 44300.291666666664 | 1.88 |
| 44300.302083333336 | 2.03 |
| 44300.3125 | 2.21 |
| 44300.322916666664 | 2.25 |
| 44300.333333333336 | 2.36 |
| 44300.34375 | 2.53 |
| 44300.354166666664 | 2.45 |
| 44300.364583333336 | 2.87 |
| 44300.375 | 2.61 |
| 44300.385416666664 | 3.12 |
| 44300.395833333336 | 2.59 |
| 44300.40625 | 2.32 |
| 44300.416666666664 | 2.69 |
| 44300.427083333336 | 2.23 |
| 44300.4375 | 2.18 |
| 44300.447916666664 | 1.91 |
| 44300.458333333336 | 1.94 |
| 44300.46875 | 1.42 |
| 44300.479166666664 | 1.22 |
| 44300.489583333336 | 1.29 |
| 44300.5 | 1.2 |
| 44300.510416666664 | 1.13 |
| 44300.520833333336 | 1 |
| 44300.53125 | 0.87 |
| 44300.541666666664 | 0.73 |
| 44300.552083333336 | 0.71 |
| 44300.5625 | 0.61 |
| 44300.572916666664 | 0.7 |
| 44300.583333333336 | 0.68 |
| 44300.59375 | 0.58 |
| 44300.604166666664 | 0.62 |
| 44300.614583333336 | 0.58 |
| 44300.625 | 0.55 |
| 44300.635416666664 | 0.54 |
| 44300.645833333336 | 0.59 |
| 44300.65625 | 0.73 |
| 44300.666666666664 | 0.57 |
| 44300.677083333336 | 0.72 |
| 44300.6875 | 0.54 |
| 44300.697916666664 | 0.6 |
| 44300.708333333336 | 0.81 |
| 44300.71875 | 0.84 |
| 44300.729166666664 | 0.96 |
| 44300.739583333336 | 1.11 |
| 44300.75 | 1.13 |
| 44300.760416666664 | 1.25 |
| 44300.770833333336 | 1.46 |
| 44300.78125 | 1.71 |
| 44300.791666666664 | 1.88 |
| 44300.802083333336 | 2.01 |
| 44300.8125 | 2.54 |
| 44300.822916666664 | 2.57 |
| 44300.833333333336 | 2.95 |
| 44300.84375 | 3.06 |
| 44300.854166666664 | 3.6 |
| 44300.864583333336 | 3.76 |
| 44300.875 | 4.64 |
| 44300.885416666664 | 4.02 |
| 44300.895833333336 | 3.56 |
| 44300.90625 | 3.27 |
| 44300.916666666664 | 2.82 |
| 44300.927083333336 | 2.63 |
| 44300.9375 | 2.18 |
| 44300.947916666664 | 1.9 |
| 44300.958333333336 | 1.74 |
| 44300.96875 | 1.75 |
| 44300.979166666664 | 1.83 |
| 44300.989583333336 | 1.7 |
| 44301.0 | 1.86 |
| 44301.010416666664 | 1.75 |
| 44301.020833333336 | 1.68 |
| 44301.03125 | 1.63 |
| 44301.041666666664 | 1.77 |
| 44301.052083333336 | 1.4 |
| 44301.0625 | 1.56 |
| 44301.072916666664 | 1.42 |
| 44301.083333333336 | 1.45 |
| 44301.09375 | 1.49 |
| 44301.104166666664 | 1.43 |
| 44301.114583333336 | 1.25 |
| 44301.125 | 1.25 |
| 44301.135416666664 | 1.36 |
| 44301.145833333336 | 1.15 |
| 44301.15625 | 1.32 |
| 44301.166666666664 | 1.52 |
| 44301.177083333336 | 1.71 |
| 44301.1875 | 1.59 |
| 44301.197916666664 | 1.71 |
| 44301.208333333336 | 1.84 |
| 44301.21875 | 1.65 |
| 44301.229166666664 | 1.66 |
| 44301.239583333336 | 1.49 |
| 44301.25 | 1.77 |
| 44301.260416666664 | 1.52 |
| 44301.270833333336 | 1.48 |
| 44301.28125 | 1.63 |
| 44301.291666666664 | 1.58 |
| 44301.302083333336 | 1.64 |
| 44301.3125 | 1.66 |
| 44301.322916666664 | 1.64 |
| 44301.333333333336 | 1.63 |
| 44301.34375 | 1.56 |
| 44301.354166666664 | 1.95 |
| 44301.364583333336 | 1.9 |
| 44301.375 | 2.19 |
| 44301.385416666664 | 2.11 |
| 44301.395833333336 | 2.39 |
| 44301.40625 | 2.69 |
| 44301.416666666664 | 2.43 |
| 44301.427083333336 | 3.53 |
| 44301.4375 | 2.51 |
| 44301.447916666664 | 1.88 |
| 44301.458333333336 | 1.7 |
| 44301.46875 | 1.46 |
| 44301.479166666664 | 1.38 |
| 44301.489583333336 | 1.32 |
| 44301.5 | 1.15 |
| 44301.510416666664 | 1.06 |
| 44301.520833333336 | 1.09 |
| 44301.53125 | 0.91 |
| 44301.541666666664 | 0.83 |
| 44301.552083333336 | 0.78 |
| 44301.5625 | 0.95 |
| 44301.572916666664 | 0.91 |
| 44301.583333333336 | 0.83 |
| 44301.59375 | 0.97 |
| 44301.604166666664 | 0.79 |
| 44301.614583333336 | 0.6 |
| 44301.625 | 0.57 |
| 44301.635416666664 | 0.8 |
| 44301.645833333336 | 0.74 |
| 44301.65625 | 0.7 |
| 44301.666666666664 | 0.75 |
| 44301.677083333336 | 0.7 |
| 44301.6875 | 0.74 |
| 44301.697916666664 | 0.66 |
| 44301.708333333336 | 0.66 |
| 44301.71875 | 0.77 |
| 44301.729166666664 | 0.93 |
| 44301.739583333336 | 0.81 |
| 44301.75 | 0.9 |
| 44301.760416666664 | 0.89 |
| 44301.770833333336 | 1.13 |
| 44301.78125 | 1.14 |
| 44301.791666666664 | 1.4 |
| 44301.802083333336 | 1.26 |
| 44301.8125 | 1.34 |
| 44301.822916666664 | 1.45 |
| 44301.833333333336 | 1.71 |
| 44301.84375 | 1.79 |
| 44301.854166666664 | 1.79 |
| 44301.864583333336 | 2.21 |
| 44301.875 | 2.54 |
| 44301.885416666664 | 2.52 |
| 44301.895833333336 | 2.88 |
| 44301.90625 | 2.49 |
| 44301.916666666664 | 1.87 |
| 44301.927083333336 | 1.87 |
| 44301.9375 | 1.81 |
| 44301.947916666664 | 1.75 |
| 44301.958333333336 | 1.84 |
| 44301.96875 | 1.56 |
| 44301.979166666664 | 1.53 |
| 44301.989583333336 | 1.44 |
| 44302.0 | 1.52 |
| 44302.010416666664 | 1.35 |
| 44302.020833333336 | 1.38 |
| 44302.03125 | 1.33 |
| 44302.041666666664 | 1.3 |
| 44302.052083333336 | 1.23 |
| 44302.0625 | 1.39 |
| 44302.072916666664 | 1.33 |
| 44302.083333333336 | 1.43 |
| 44302.09375 | 1.08 |
| 44302.104166666664 | 1.03 |
| 44302.114583333336 | 1.13 |
| 44302.125 | 0.89 |
| 44302.135416666664 | 1.18 |
| 44302.145833333336 | 1.02 |
| 44302.15625 | 1.04 |
| 44302.166666666664 | 1.15 |
| 44302.177083333336 | 1 |
| 44302.1875 | 1.11 |
| 44302.197916666664 | 1.11 |
| 44302.208333333336 | 1.42 |
| 44302.21875 | 1.22 |
| 44302.229166666664 | 1.25 |
| 44302.239583333336 | 1.2 |
| 44302.25 | 1.3 |
| 44302.260416666664 | 1.2 |
| 44302.270833333336 | 1.25 |
| 44302.28125 | 1.34 |
| 44302.291666666664 | 1.18 |
| 44302.302083333336 | 1.2 |
| 44302.3125 | 1.37 |
| 44302.322916666664 | 1.19 |
| 44302.333333333336 | 1.28 |
| 44302.34375 | 1.36 |
| 44302.354166666664 | 1.41 |
| 44302.364583333336 | 1.45 |
| 44302.375 | 1.51 |
| 44302.385416666664 | 1.62 |
| 44302.395833333336 | 1.67 |
| 44302.40625 | 1.97 |
| 44302.416666666664 | 2.13 |
| 44302.427083333336 | 2.38 |
| 44302.4375 | 2.5 |
| 44302.447916666664 | 1.52 |
| 44302.458333333336 | 1.45 |
| 44302.46875 | 1.27 |
| 44302.479166666664 | 1.15 |
| 44302.489583333336 | 1.2 |
| 44302.5 | 0.91 |
| 44302.510416666664 | 0.84 |
| 44302.520833333336 | 0.68 |
| 44302.53125 | 0.63 |
| 44302.541666666664 | 0.7 |
| 44302.552083333336 | 0.53 |
| 44302.5625 | 0.53 |
| 44302.572916666664 | 0.56 |
| 44302.583333333336 | 0.42 |
| 44302.59375 | 0.54 |
| 44302.604166666664 | 0.45 |
| 44302.614583333336 | 0.52 |
| 44302.625 | 0.53 |
| 44302.635416666664 | 0.58 |
| 44302.645833333336 | 0.36 |
| 44302.65625 | 0.53 |
| 44302.666666666664 | 0.34 |
| 44302.677083333336 | 0.31 |
| 44302.6875 | 0.5 |
| 44302.697916666664 | 0.47 |
| 44302.708333333336 | 0.43 |
| 44302.71875 | 0.48 |
| 44302.729166666664 | 0.46 |
| 44302.739583333336 | 0.54 |
| 44302.75 | 0.45 |
| 44302.760416666664 | 0.69 |
| 44302.770833333336 | 0.8 |
| 44302.78125 | 0.79 |
| 44302.791666666664 | 0.66 |
| 44302.802083333336 | 0.75 |
| 44302.8125 | 0.97 |
| 44302.822916666664 | 0.87 |
| 44302.833333333336 | 1.13 |
| 44302.84375 | 1.15 |
| 44302.854166666664 | 1.31 |
| 44302.864583333336 | 1.34 |
| 44302.875 | 1.7 |
| 44302.885416666664 | 1.77 |
| 44302.895833333336 | 1.96 |
| 44302.90625 | 2.23 |
| 44302.916666666664 | 2.35 |
| 44302.927083333336 | 3.05 |
| 44302.9375 | 1.93 |
| 44302.947916666664 | 2.04 |
| 44302.958333333336 | 1.84 |
| 44302.96875 | 1.73 |
| 44302.979166666664 | 1.95 |
| 44302.989583333336 | 1.54 |
| 44303.0 | 1.64 |
| 44303.010416666664 | 1.55 |
| 44303.020833333336 | 1.46 |
| 44303.03125 | 1.16 |
| 44303.041666666664 | 1.24 |
| 44303.052083333336 | 1.21 |
| 44303.0625 | 1.1 |
| 44303.072916666664 | 1.21 |
| 44303.083333333336 | 1.11 |
| 44303.09375 | 1.04 |
| 44303.104166666664 | 0.93 |
| 44303.114583333336 | 0.99 |
| 44303.125 | 1.03 |
| 44303.135416666664 | 1.02 |
| 44303.145833333336 | 1.1 |
| 44303.15625 | 1.07 |
| 44303.166666666664 | 1.07 |
| 44303.177083333336 | 1.14 |
| 44303.1875 | 1.1 |
| 44303.197916666664 | 0.91 |
| 44303.208333333336 | 1.25 |
| 44303.21875 | 1.1 |
| 44303.229166666664 | 1.16 |
| 44303.239583333336 | 1.11 |
| 44303.25 | 1.06 |
| 44303.260416666664 | 1.14 |
| 44303.270833333336 | 1 |
| 44303.28125 | 1.21 |
| 44303.291666666664 | 1 |
| 44303.302083333336 | 1.23 |
| 44303.3125 | 1.04 |
| 44303.322916666664 | 1.09 |
| 44303.333333333336 | 1.1 |
| 44303.34375 | 1.19 |
| 44303.354166666664 | 1.18 |
| 44303.364583333336 | 1.24 |
| 44303.375 | 1.22 |
| 44303.385416666664 | 1.36 |
| 44303.395833333336 | 1.36 |
| 44303.40625 | 1.58 |
| 44303.416666666664 | 1.58 |
| 44303.427083333336 | 1.79 |
| 44303.4375 | 1.48 |
| 44303.447916666664 | 1.6 |
| 44303.458333333336 | 1.57 |
| 44303.46875 | 2.01 |
| 44303.479166666664 | 1.92 |
| 44303.489583333336 | 1.73 |
| 44303.5 | 2.02 |
| 44303.510416666664 | 1.38 |
| 44303.520833333336 | 0.97 |
| 44303.53125 | 1.16 |
| 44303.541666666664 | 0.95 |
| 44303.552083333336 | 0.84 |
| 44303.5625 | 0.67 |
| 44303.572916666664 | 0.56 |
| 44303.583333333336 | 0.49 |
| 44303.59375 | 0.46 |
| 44303.604166666664 | 0.54 |
| 44303.614583333336 | 0.41 |
| 44303.625 | 0.5 |
| 44303.635416666664 | 0.42 |
| 44303.645833333336 | 0.41 |
| 44303.65625 | 0.44 |
| 44303.666666666664 | 0.47 |
| 44303.677083333336 | 0.46 |
| 44303.6875 | 0.43 |
| 44303.697916666664 | 0.42 |
| 44303.708333333336 | 0.45 |
| 44303.71875 | 0.71 |
| 44303.729166666664 | 0.67 |
| 44303.739583333336 | 0.5 |
| 44303.75 | 0.44 |
| 44303.760416666664 | 0.55 |
| 44303.770833333336 | 0.78 |
| 44303.78125 | 0.73 |
| 44303.791666666664 | 0.72 |
| 44303.802083333336 | 0.84 |
| 44303.8125 | 0.84 |
| 44303.822916666664 | 1.09 |
| 44303.833333333336 | 1.22 |
| 44303.84375 | 1.33 |
| 44303.854166666664 | 1.62 |
| 44303.864583333336 | 1.89 |
| 44303.875 | 2.07 |
| 44303.885416666664 | 2.33 |
| 44303.895833333336 | 2.42 |
| 44303.90625 | 2.45 |
| 44303.916666666664 | 2.75 |
| 44303.927083333336 | 3.02 |
| 44303.9375 | 3.54 |
| 44303.947916666664 | 3.64 |
| 44303.958333333336 | 2.83 |
| 44303.96875 | 3.55 |
| 44303.979166666664 | 2.66 |
| 44303.989583333336 | 2.48 |
| 44304.0 | 2.79 |
| 44304.010416666664 | 3.42 |
| 44304.020833333336 | 2.3 |
| 44304.03125 | 1.97 |
| 44304.041666666664 | 1.44 |
| 44304.052083333336 | 1.35 |
| 44304.0625 | 1.51 |
| 44304.072916666664 | 1.27 |
| 44304.083333333336 | 1.27 |
| 44304.09375 | 1.13 |
| 44304.104166666664 | 1.19 |
| 44304.114583333336 | 1.14 |
| 44304.125 | 1.1 |
| 44304.135416666664 | 1.04 |
| 44304.145833333336 | 1.02 |
| 44304.15625 | 0.96 |
| 44304.166666666664 | 0.9 |
| 44304.177083333336 | 1.03 |
| 44304.1875 | 1.2 |
| 44304.197916666664 | 1.07 |
| 44304.208333333336 | 0.93 |
| 44304.21875 | 1.07 |
| 44304.229166666664 | 1.01 |
| 44304.239583333336 | 0.95 |
| 44304.25 | 1.06 |
| 44304.260416666664 | 1.2 |
| 44304.270833333336 | 1.04 |
| 44304.28125 | 0.99 |
| 44304.291666666664 | 0.86 |
| 44304.302083333336 | 0.96 |
| 44304.3125 | 0.94 |
| 44304.322916666664 | 1.09 |
| 44304.333333333336 | 1.1 |
| 44304.34375 | 1 |
| 44304.354166666664 | 0.97 |
| 44304.364583333336 | 1.02 |
| 44304.375 | 1.03 |
| 44304.385416666664 | 1.03 |
| 44304.395833333336 | 1.04 |
| 44304.40625 | 1.1 |
| 44304.416666666664 | 1.19 |
| 44304.427083333336 | 1.33 |
| 44304.4375 | 1.3 |
| 44304.447916666664 | 1.21 |
| 44304.458333333336 | 1.3 |
| 44304.46875 | 1.33 |
| 44304.479166666664 | 1.65 |
| 44304.489583333336 | 1.86 |
| 44304.5 | 3.16 |
| 44304.510416666664 | 1.56 |
| 44304.520833333336 | 1.37 |
| 44304.53125 | 0.99 |
| 44304.541666666664 | 0.89 |
| 44304.552083333336 | 0.87 |
| 44304.5625 | 0.75 |
| 44304.572916666664 | 0.71 |
| 44304.583333333336 | 0.64 |
| 44304.59375 | 0.62 |
| 44304.604166666664 | 0.46 |
| 44304.614583333336 | 0.39 |
| 44304.625 | 0.48 |
| 44304.635416666664 | 0.79 |
| 44304.645833333336 | 0.58 |
| 44304.65625 | 0.48 |
| 44304.666666666664 | 0.48 |
| 44304.677083333336 | 0.36 |
| 44304.6875 | 0.66 |
| 44304.697916666664 | 0.49 |
| 44304.708333333336 | 0.52 |
| 44304.71875 | 0.4 |
| 44304.729166666664 | 0.6 |
| 44304.739583333336 | 0.56 |
| 44304.75 | 0.79 |
| 44304.760416666664 | 0.65 |
| 44304.770833333336 | 0.62 |
| 44304.78125 | 0.7 |
| 44304.791666666664 | 0.63 |
| 44304.802083333336 | 0.81 |
| 44304.8125 | 0.77 |
| 44304.822916666664 | 0.81 |
| 44304.833333333336 | 1.04 |
| 44304.84375 | 1.04 |
| 44304.854166666664 | 1.08 |
| 44304.864583333336 | 1.13 |
| 44304.875 | 1.31 |
| 44304.885416666664 | 1.42 |
| 44304.895833333336 | 1.64 |
| 44304.90625 | 1.79 |
| 44304.916666666664 | 1.97 |
| 44304.927083333336 | 2.21 |
| 44304.9375 | 2.25 |
| 44304.947916666664 | 2.43 |
| 44304.958333333336 | 2.65 |
| 44304.96875 | 2.69 |
| 44304.979166666664 | 3.01 |
| 44304.989583333336 | 3.35 |
| 44305.0 | 3.38 |
| 44305.010416666664 | 3.44 |
| 44305.020833333336 | 3.22 |
| 44305.03125 | 2.47 |
| 44305.041666666664 | 2.1 |
| 44305.052083333336 | 2.29 |
| 44305.0625 | 1.7 |
| 44305.072916666664 | 1.62 |
| 44305.083333333336 | 1.59 |
| 44305.09375 | 1.63 |
| 44305.104166666664 | 1.42 |
| 44305.114583333336 | 1.38 |
| 44305.125 | 1.2 |
| 44305.135416666664 | 1.39 |
| 44305.145833333336 | 1.31 |
| 44305.15625 | 1.35 |
| 44305.166666666664 | 1.2 |
| 44305.177083333336 | 1.03 |
| 44305.1875 | 1.29 |
| 44305.197916666664 | 1.03 |
| 44305.208333333336 | 1.1 |
| 44305.21875 | 1.09 |
| 44305.229166666664 | 1.09 |
| 44305.239583333336 | 1.21 |
| 44305.25 | 0.84 |
| 44305.260416666664 | 0.87 |
| 44305.270833333336 | 1.01 |
| 44305.28125 | 1.06 |
| 44305.291666666664 | 1.05 |
| 44305.302083333336 | 1.06 |
| 44305.3125 | 1.05 |
| 44305.322916666664 | 1.07 |
| 44305.333333333336 | 1.02 |
| 44305.34375 | 0.97 |
| 44305.354166666664 | 1.15 |
| 44305.364583333336 | 1.11 |
| 44305.375 | 1.15 |
| 44305.385416666664 | 1.14 |
| 44305.395833333336 | 1.06 |
| 44305.40625 | 1.03 |
| 44305.416666666664 | 1 |
| 44305.427083333336 | 1.16 |
| 44305.4375 | 1.16 |
| 44305.447916666664 | 1.27 |
| 44305.458333333336 | 1.2 |
| 44305.46875 | 1.3 |
| 44305.479166666664 | 1.3 |
| 44305.489583333336 | 1.41 |
| 44305.5 | 1.53 |
| 44305.510416666664 | 1.59 |
| 44305.520833333336 | 1.51 |
| 44305.53125 | 1.8 |
| 44305.541666666664 | 1.56 |
| 44305.552083333336 | 1.48 |
| 44305.5625 | 1.23 |
| 44305.572916666664 | 1.17 |
| 44305.583333333336 | 1.15 |
| 44305.59375 | 1.19 |
| 44305.604166666664 | 1.16 |
| 44305.614583333336 | 0.94 |
| 44305.625 | 0.83 |
| 44305.635416666664 | 0.83 |
| 44305.645833333336 | 0.79 |
| 44305.65625 | 0.72 |
| 44305.666666666664 | 0.78 |
| 44305.677083333336 | 0.78 |
| 44305.6875 | 0.79 |
| 44305.697916666664 | 0.8 |
| 44305.708333333336 | 0.78 |
| 44305.71875 | 0.82 |
| 44305.729166666664 | 0.81 |
| 44305.739583333336 | 0.7 |
| 44305.75 | 0.72 |
| 44305.760416666664 | 0.79 |
| 44305.770833333336 | 0.91 |
| 44305.78125 | 0.94 |
| 44305.791666666664 | 1.12 |
| 44305.802083333336 | 0.93 |
| 44305.8125 | 1.16 |
| 44305.822916666664 | 1.33 |
| 44305.833333333336 | 1.18 |
| 44305.84375 | 1.08 |
| 44305.854166666664 | 1.22 |
| 44305.864583333336 | 1.36 |
| 44305.875 | 1.35 |
| 44305.885416666664 | 1.67 |
| 44305.895833333336 | 1.78 |
| 44305.90625 | 1.93 |
| 44305.916666666664 | 2.08 |
| 44305.927083333336 | 2.51 |
| 44305.9375 | 2.9 |
| 44305.947916666664 | 3.01 |
| 44305.958333333336 | 3.35 |
| 44305.96875 | 3.46 |
| 44305.979166666664 | 4.55 |
| 44305.989583333336 | 4.46 |
| 44306.0 | 4.75 |
| 44306.010416666664 | 5.22 |
| 44306.020833333336 | 5.85 |
| 44306.03125 | 5.07 |
| 44306.041666666664 | 4.38 |
| 44306.052083333336 | 3.37 |
| 44306.0625 | 3.3 |
| 44306.072916666664 | 3.22 |
| 44306.083333333336 | 2.66 |
| 44306.09375 | 2.15 |
| 44306.104166666664 | 2.6 |
| 44306.114583333336 | 1.99 |
| 44306.125 | 2.79 |
| 44306.135416666664 | 1.9 |
| 44306.145833333336 | 2.16 |
| 44306.15625 | 1.61 |
| 44306.166666666664 | 1.44 |
| 44306.177083333336 | 1.43 |
| 44306.1875 | 1.33 |
| 44306.197916666664 | 1.36 |
| 44306.208333333336 | 1.39 |
| 44306.21875 | 1.36 |
| 44306.229166666664 | 1.3 |
| 44306.239583333336 | 1.08 |
| 44306.25 | 1.23 |
| 44306.260416666664 | 1.19 |
| 44306.270833333336 | 1.32 |
| 44306.28125 | 1.35 |
| 44306.291666666664 | 1.19 |
| 44306.302083333336 | 1.37 |
| 44306.3125 | 1.12 |
| 44306.322916666664 | 1.13 |
| 44306.333333333336 | 1.3 |
| 44306.34375 | 1.2 |
| 44306.354166666664 | 1.18 |
| 44306.364583333336 | 1.07 |
| 44306.375 | 1.19 |
| 44306.385416666664 | 1.12 |
| 44306.395833333336 | 1.19 |
| 44306.40625 | 1.17 |
| 44306.416666666664 | 1.22 |
| 44306.427083333336 | 1.27 |
| 44306.4375 | 1.31 |
| 44306.447916666664 | 1.35 |
| 44306.458333333336 | 1.47 |
| 44306.46875 | 1.73 |
| 44306.479166666664 | 1.78 |
| 44306.489583333336 | 2.05 |
| 44306.5 | 1.8 |
| 44306.510416666664 | 1.89 |
| 44306.520833333336 | 1.92 |
| 44306.53125 | 2.19 |
| 44306.541666666664 | 1.65 |
| 44306.552083333336 | 2.28 |
| 44306.5625 | 1.56 |
| 44306.572916666664 | 1.61 |
| 44306.583333333336 | 1.22 |
| 44306.59375 | 1.46 |
| 44306.604166666664 | 0.93 |
| 44306.614583333336 | 0.95 |
| 44306.625 | 0.98 |
| 44306.635416666664 | 0.91 |
| 44306.645833333336 | 0.88 |
| 44306.65625 | 0.77 |
| 44306.666666666664 | 0.73 |
| 44306.677083333336 | 0.6 |
| 44306.6875 | 0.73 |
| 44306.697916666664 | 0.66 |
| 44306.708333333336 | 0.63 |
| 44306.71875 | 0.55 |
| 44306.729166666664 | 0.61 |
| 44306.739583333336 | 0.7 |
| 44306.75 | 0.54 |
| 44306.760416666664 | 0.59 |
| 44306.770833333336 | 0.7 |
| 44306.78125 | 0.68 |
| 44306.791666666664 | 0.67 |
| 44306.802083333336 | 0.74 |
| 44306.8125 | 0.61 |
| 44306.822916666664 | 0.66 |
| 44306.833333333336 | 0.67 |
| 44306.84375 | 1.02 |
| 44306.854166666664 | 1.07 |
| 44306.864583333336 | 1.01 |
| 44306.875 | 1.03 |
| 44306.885416666664 | 0.97 |
| 44306.895833333336 | 1.22 |
| 44306.90625 | 1.36 |
| 44306.916666666664 | 1.28 |
| 44306.927083333336 | 1.46 |
| 44306.9375 | 1.63 |
| 44306.947916666664 | 1.91 |
| 44306.958333333336 | 1.86 |
| 44306.96875 | 1.69 |
| 44306.979166666664 | 1.84 |
| 44306.989583333336 | 1.87 |
| 44307.0 | 2.19 |
| 44307.010416666664 | 2.42 |
| 44307.020833333336 | 2.27 |
| 44307.03125 | 2.43 |
| 44307.041666666664 | 2.27 |
| 44307.052083333336 | 2.21 |
| 44307.0625 | 2.29 |
| 44307.072916666664 | 2.12 |
| 44307.083333333336 | 1.78 |
| 44307.09375 | 1.32 |
| 44307.104166666664 | 1.36 |
| 44307.114583333336 | 1.35 |
| 44307.125 | 1.43 |
| 44307.135416666664 | 1.65 |
| 44307.145833333336 | 1.87 |
| 44307.15625 | 1.79 |
| 44307.166666666664 | 1.66 |
| 44307.177083333336 | 1.62 |
| 44307.1875 | 1.65 |
| 44307.197916666664 | 1.78 |
| 44307.208333333336 | 1.72 |
| 44307.21875 | 1.81 |
| 44307.229166666664 | 1.64 |
| 44307.239583333336 | 1.67 |
| 44307.25 | 1.68 |
| 44307.260416666664 | 1.58 |
| 44307.270833333336 | 1.38 |
| 44307.28125 | 1.6 |
| 44307.291666666664 | 1.2 |
| 44307.302083333336 | 1.21 |
| 44307.3125 | 1.26 |
| 44307.322916666664 | 1.59 |
| 44307.333333333336 | 1.19 |
| 44307.34375 | 1.18 |
| 44307.354166666664 | 1.23 |
| 44307.364583333336 | 1.39 |
| 44307.375 | 1.16 |
| 44307.385416666664 | 1.22 |
| 44307.395833333336 | 1.27 |
| 44307.40625 | 1.29 |
| 44307.416666666664 | 1.39 |
| 44307.427083333336 | 1.32 |
| 44307.4375 | 1.21 |
| 44307.447916666664 | 1.1 |
| 44307.458333333336 | 0.93 |
| 44307.46875 | 1.28 |
| 44307.479166666664 | 1.37 |
| 44307.489583333336 | 1.52 |
| 44307.5 | 1.64 |
| 44307.510416666664 | 1.97 |
| 44307.520833333336 | 1.9 |
| 44307.53125 | 2.14 |
| 44307.541666666664 | 2.26 |
| 44307.552083333336 | 2.22 |
| 44307.5625 | 2.3 |
| 44307.572916666664 | 1.87 |
| 44307.583333333336 | 2.07 |
| 44307.59375 | 2.05 |
| 44307.604166666664 | 2.28 |
| 44307.614583333336 | 1.63 |
| 44307.625 | 1.46 |
| 44307.635416666664 | 1.42 |
| 44307.645833333336 | 1.21 |
| 44307.65625 | 1.09 |
| 44307.666666666664 | 0.98 |
| 44307.677083333336 | 0.94 |
| 44307.6875 | 0.82 |
| 44307.697916666664 | 0.87 |
| 44307.708333333336 | 1.21 |
| 44307.71875 | 0.84 |
| 44307.729166666664 | 1 |
| 44307.739583333336 | 2.42 |
| 44307.75 | 3.74 |
| 44307.760416666664 | 3.25 |
| 44307.770833333336 | 1.58 |
| 44307.78125 | 1.56 |
| 44307.791666666664 | 1.51 |
| 44307.802083333336 | 1.74 |
| 44307.8125 | 1.54 |
| 44307.822916666664 | 1.77 |
| 44307.833333333336 | 1.57 |
| 44307.84375 | 1.59 |
| 44307.854166666664 | 1.58 |
| 44307.864583333336 | 1.47 |
| 44307.875 | 1.46 |
| 44307.885416666664 | 1.4 |
| 44307.895833333336 | 1.4 |
| 44307.90625 | 1.58 |
| 44307.916666666664 | 1.55 |
| 44307.927083333336 | 1.58 |
| 44307.9375 | 1.57 |
| 44307.947916666664 | 1.77 |
| 44307.958333333336 | 1.82 |
| 44307.96875 | 2.16 |
| 44307.979166666664 | 2.59 |
| 44307.989583333336 | 3.42 |
| 44308.0 | 4.19 |
| 44308.010416666664 | 4.75 |
| 44308.020833333336 | 4.75 |
| 44308.03125 | 5.13 |
| 44308.041666666664 | 5.71 |
| 44308.052083333336 | 6.17 |
| 44308.0625 | 6.79 |
| 44308.072916666664 | 8.03 |
| 44308.083333333336 | 8.68 |
| 44308.09375 | 7.38 |
| 44308.104166666664 | 8.64 |
| 44308.114583333336 | 9.57 |
| 44308.125 | 7.45 |
| 44308.135416666664 | 5.82 |
| 44308.145833333336 | 5.59 |
| 44308.15625 | 4.82 |
| 44308.166666666664 | 3.83 |
| 44308.177083333336 | 3.36 |
| 44308.1875 | 3.14 |
| 44308.197916666664 | 2.85 |
| 44308.208333333336 | 2.48 |
| 44308.21875 | 2.44 |
| 44308.229166666664 | 2.1 |
| 44308.239583333336 | 2.14 |
| 44308.25 | 2.2 |
| 44308.260416666664 | 2.12 |
| 44308.270833333336 | 2.2 |
| 44308.28125 | 1.97 |
| 44308.291666666664 | 2.38 |
| 44308.302083333336 | 2.12 |
| 44308.3125 | 2.14 |
| 44308.322916666664 | 2.05 |
| 44308.333333333336 | 2.17 |
| 44308.34375 | 2.25 |
| 44308.354166666664 | 2.17 |
| 44308.364583333336 | 2.19 |
| 44308.375 | 2.03 |
| 44308.385416666664 | 2.08 |
| 44308.395833333336 | 2.07 |
| 44308.40625 | 2.14 |
| 44308.416666666664 | 2.25 |
| 44308.427083333336 | 2.14 |
| 44308.4375 | 1.77 |
| 44308.447916666664 | 1.6 |
| 44308.458333333336 | 1.73 |
| 44308.46875 | 1.61 |
| 44308.479166666664 | 1.77 |
| 44308.489583333336 | 1.59 |
| 44308.5 | 1.46 |
| 44308.510416666664 | 1.44 |
| 44308.520833333336 | 1.27 |
| 44308.53125 | 1.02 |
| 44308.541666666664 | 1.06 |
| 44308.552083333336 | 1.08 |
| 44308.5625 | 1.13 |
| 44308.572916666664 | 1.5 |
| 44308.583333333336 | 1.43 |
| 44308.59375 | 1.62 |
| 44308.604166666664 | 1.86 |
| 44308.614583333336 | 2.63 |
| 44308.625 | 2.01 |
| 44308.635416666664 | 3.04 |
| 44308.645833333336 | 3.18 |
| 44308.65625 | 3.36 |
| 44308.666666666664 | 1.96 |
| 44308.677083333336 | 2.43 |
| 44308.6875 | 3.17 |
| 44308.697916666664 | 1.6 |
| 44308.708333333336 | 1.9 |
| 44308.71875 | 1.73 |
| 44308.729166666664 | 1.34 |
| 44308.739583333336 | 1.22 |
| 44308.75 | 1.23 |
| 44308.760416666664 | 1.18 |
| 44308.770833333336 | 1.22 |
| 44308.78125 | 1.15 |
| 44308.791666666664 | 1.34 |
| 44308.802083333336 | 1.31 |
| 44308.8125 | 1.32 |
| 44308.822916666664 | 1.37 |
| 44308.833333333336 | 1.25 |
| 44308.84375 | 1.4 |
| 44308.854166666664 | 1.46 |
| 44308.864583333336 | 1.31 |
| 44308.875 | 1.38 |
| 44308.885416666664 | 1.65 |
| 44308.895833333336 | 1.5 |
| 44308.90625 | 1.71 |
| 44308.916666666664 | 1.59 |
| 44308.927083333336 | 1.52 |
| 44308.9375 | 1.36 |
| 44308.947916666664 | 1.44 |
| 44308.958333333336 | 1.45 |
| 44308.96875 | 1.36 |
| 44308.979166666664 | 1.53 |
| 44308.989583333336 | 1.63 |
| 44309.0 | 1.78 |
| 44309.010416666664 | 2.12 |
| 44309.020833333336 | 2.44 |
| 44309.03125 | 2.73 |
| 44309.041666666664 | 3.12 |
| 44309.052083333336 | 3.59 |
| 44309.0625 | 3.95 |
| 44309.072916666664 | 4.01 |
| 44309.083333333336 | 4.17 |
| 44309.09375 | 4.88 |
| 44309.104166666664 | 5.56 |
| 44309.114583333336 | 5.69 |
| 44309.125 | 6.08 |
| 44309.135416666664 | 6.47 |
| 44309.145833333336 | 7.39 |
| 44309.15625 | 5.62 |
| 44309.166666666664 | 5.25 |
| 44309.177083333336 | 4.91 |
| 44309.1875 | 5.04 |
| 44309.197916666664 | 4.89 |
| 44309.208333333336 | 4.73 |
| 44309.21875 | 4.01 |
| 44309.229166666664 | 3.5 |
| 44309.239583333336 | 2.87 |
| 44309.25 | 2.63 |
| 44309.260416666664 | 2.3 |
| 44309.270833333336 | 1.98 |
| 44309.28125 | 1.84 |
| 44309.291666666664 | 1.48 |
| 44309.302083333336 | 1.26 |
| 44309.3125 | 1.24 |
| 44309.322916666664 | 1.02 |
| 44309.333333333336 | 0.9 |
| 44309.34375 | 0.9 |
| 44309.354166666664 | 1.03 |
| 44309.364583333336 | 0.86 |
| 44309.375 | 0.93 |
| 44309.385416666664 | 0.95 |
| 44309.395833333336 | 0.89 |
| 44309.40625 | 1.15 |
| 44309.416666666664 | 0.97 |
| 44309.427083333336 | 1.3 |
| 44309.4375 | 1.47 |
| 44309.447916666664 | 1 |
| 44309.458333333336 | 0.93 |
| 44309.46875 | 0.87 |
| 44309.479166666664 | 0.99 |
| 44309.489583333336 | 0.95 |
| 44309.5 | 1 |
| 44309.510416666664 | 0.86 |
| 44309.520833333336 | 0.95 |
| 44309.53125 | 1.04 |
| 44309.541666666664 | 1.25 |
| 44309.552083333336 | 1.81 |
| 44309.5625 | 1.43 |
| 44309.572916666664 | 1.42 |
| 44309.583333333336 | 2.29 |
| 44309.59375 | 1.62 |
| 44309.604166666664 | 2.55 |
| 44309.614583333336 | 3.11 |
| 44309.625 | 3.79 |
| 44309.635416666664 | 3.48 |
| 44309.645833333336 | 4.73 |
| 44309.65625 | 4.32 |
| 44309.666666666664 | 4.51 |
| 44309.677083333336 | 3.98 |
| 44309.6875 | 3.95 |
| 44309.697916666664 | 3.93 |
| 44309.708333333336 | 4.3 |
| 44309.71875 | 4.65 |
| 44309.729166666664 | 4.55 |
| 44309.739583333336 | 4.93 |
| 44309.75 | 4.88 |
| 44309.760416666664 | 5.58 |
| 44309.770833333336 | 4.97 |
| 44309.78125 | 4.47 |
| 44309.791666666664 | 4.2 |
| 44309.802083333336 | 3.5 |
| 44309.8125 | 3.07 |
| 44309.822916666664 | 3.16 |
| 44309.833333333336 | 3.04 |
| 44309.84375 | 3.11 |
| 44309.854166666664 | 2.94 |
| 44309.864583333336 | 3.13 |
| 44309.875 | 2.94 |
| 44309.885416666664 | 2.81 |
| 44309.895833333336 | 2.69 |
| 44309.90625 | 2.7 |
| 44309.916666666664 | 2.56 |
| 44309.927083333336 | 2.37 |
| 44309.9375 | 2.41 |
| 44309.947916666664 | 2.42 |
| 44309.958333333336 | 2.46 |
| 44309.96875 | 2.83 |
| 44309.979166666664 | 2.59 |
| 44309.989583333336 | 2.6 |
| 44310.0 | 2.7 |
| 44310.010416666664 | 2.96 |
| 44310.020833333336 | 3.02 |
| 44310.03125 | 3.18 |
| 44310.041666666664 | 3.1 |
| 44310.052083333336 | 3.29 |
| 44310.0625 | 3.77 |
| 44310.072916666664 | 3.57 |
| 44310.083333333336 | 4.57 |
| 44310.09375 | 4.83 |
| 44310.104166666664 | 5.11 |
| 44310.114583333336 | 5.74 |
| 44310.125 | 5.54 |
| 44310.135416666664 | 5.92 |
| 44310.145833333336 | 6.22 |
| 44310.15625 | 6.41 |
| 44310.166666666664 | 6.1 |
| 44310.177083333336 | 6.93 |
| 44310.1875 | 7.84 |
| 44310.197916666664 | 8.03 |
| 44310.208333333336 | 5.96 |
| 44310.21875 | 6.56 |
| 44310.229166666664 | 6.14 |
| 44310.239583333336 | 6.31 |
| 44310.25 | 6.4 |
| 44310.260416666664 | 5.84 |
| 44310.270833333336 | 5.45 |
| 44310.28125 | 5.45 |
| 44310.291666666664 | 4.92 |
| 44310.302083333336 | 4.76 |
| 44310.3125 | 4.07 |
| 44310.322916666664 | 3.6 |
| 44310.333333333336 | 2.81 |
| 44310.34375 | 2.63 |
| 44310.354166666664 | 2.46 |
| 44310.364583333336 | 2.05 |
| 44310.375 | 2.42 |
| 44310.385416666664 | 2.29 |
| 44310.395833333336 | 2.36 |
| 44310.40625 | 2.33 |
| 44310.416666666664 | 2.44 |
| 44310.427083333336 | 2.38 |
| 44310.4375 | 2.12 |
| 44310.447916666664 | 2.23 |
| 44310.458333333336 | 2.22 |
| 44310.46875 | 2.31 |
| 44310.479166666664 | 2.16 |
| 44310.489583333336 | 2.05 |
| 44310.5 | 2.09 |
| 44310.510416666664 | 2.01 |
| 44310.520833333336 | 1.93 |
| 44310.53125 | 1.82 |
| 44310.541666666664 | 1.78 |
| 44310.552083333336 | 1.91 |
| 44310.5625 | 1.92 |
| 44310.572916666664 | 2.13 |
| 44310.583333333336 | 2.3 |
| 44310.59375 | 2.72 |
| 44310.604166666664 | 2.86 |
| 44310.614583333336 | 3.12 |
| 44310.625 | 3.11 |
| 44310.635416666664 | 3.49 |
| 44310.645833333336 | 3.44 |
| 44310.65625 | 3.71 |
| 44310.666666666664 | 4.06 |
| 44310.677083333336 | 4.32 |
| 44310.6875 | 4.33 |
| 44310.697916666664 | 5.25 |
| 44310.708333333336 | 5.25 |
| 44310.71875 | 4.75 |
| 44310.729166666664 | 4.83 |
| 44310.739583333336 | 5.61 |
| 44310.75 | 6.14 |
| 44310.760416666664 | 6.03 |
| 44310.770833333336 | 5.35 |
| 44310.78125 | 5.55 |
| 44310.791666666664 | 5.15 |
| 44310.802083333336 | 4.96 |
| 44310.8125 | 4.63 |
| 44310.822916666664 | 4.07 |
| 44310.833333333336 | 3.57 |
| 44310.84375 | 3.06 |
| 44310.854166666664 | 3.06 |
| 44310.864583333336 | 2.9 |
| 44310.875 | 2.78 |
| 44310.885416666664 | 2.53 |
| 44310.895833333336 | 2.72 |
| 44310.90625 | 2.73 |
| 44310.916666666664 | 2.76 |
| 44310.927083333336 | 2.57 |
| 44310.9375 | 2.64 |
| 44310.947916666664 | 2.77 |
| 44310.958333333336 | 2.64 |
| 44310.96875 | 2.75 |
| 44310.979166666664 | 3.32 |
| 44310.989583333336 | 3.2 |
| 44311.0 | 2.75 |
| 44311.010416666664 | 3.03 |
| 44311.020833333336 | 3 |
| 44311.03125 | 2.85 |
| 44311.041666666664 | 2.73 |
| 44311.052083333336 | 2.89 |
| 44311.0625 | 2.83 |
| 44311.072916666664 | 3.02 |
| 44311.083333333336 | 2.84 |
| 44311.09375 | 2.87 |
| 44311.104166666664 | 3.06 |
| 44311.114583333336 | 3.02 |
| 44311.125 | 3.29 |
| 44311.135416666664 | 3.43 |
| 44311.145833333336 | 3.71 |
| 44311.15625 | 3.9 |
| 44311.166666666664 | 4.32 |
| 44311.177083333336 | 4.78 |
| 44311.1875 | 5.36 |
| 44311.197916666664 | 5.09 |
| 44311.208333333336 | 5.49 |
| 44311.21875 | 6.44 |
| 44311.229166666664 | 7.33 |
| 44311.239583333336 | 5.76 |
| 44311.25 | 5.68 |
| 44311.260416666664 | 5.53 |
| 44311.270833333336 | 5.31 |
| 44311.28125 | 5.17 |
| 44311.291666666664 | 4.7 |
| 44311.302083333336 | 4.73 |
| 44311.3125 | 4.01 |
| 44311.322916666664 | 4.02 |
| 44311.333333333336 | 3.79 |
| 44311.34375 | 3.72 |
| 44311.354166666664 | 3.71 |
| 44311.364583333336 | 3.63 |
| 44311.375 | 3.47 |
| 44311.385416666664 | 3.56 |
| 44311.395833333336 | 3.39 |
| 44311.40625 | 3.28 |
| 44311.416666666664 | 3.33 |
| 44311.427083333336 | 3.12 |
| 44311.4375 | 3.04 |
| 44311.447916666664 | 2.9 |
| 44311.458333333336 | 2.73 |
| 44311.46875 | 2.66 |
| 44311.479166666664 | 2.55 |
| 44311.489583333336 | 2.47 |
| 44311.5 | 2.34 |
| 44311.510416666664 | 2.68 |
| 44311.520833333336 | 2.8 |
| 44311.53125 | 2.6 |
| 44311.541666666664 | 2.64 |
| 44311.552083333336 | 2.46 |
| 44311.5625 | 2.7 |
| 44311.572916666664 | 2.69 |
| 44311.583333333336 | 2.81 |
| 44311.59375 | 2.98 |
| 44311.604166666664 | 3.12 |
| 44311.614583333336 | 3.24 |
| 44311.625 | 3.5 |
| 44311.635416666664 | 3.44 |
| 44311.645833333336 | 3.67 |
| 44311.65625 | 3.59 |
| 44311.666666666664 | 4.74 |
| 44311.677083333336 | 5.14 |
| 44311.6875 | 5.54 |
| 44311.697916666664 | 5.66 |
| 44311.708333333336 | 4.98 |
| 44311.71875 | 5.97 |
| 44311.729166666664 | 6.79 |
| 44311.739583333336 | 6.27 |
| 44311.75 | 9.05 |
| 44311.760416666664 | 5.66 |
| 44311.770833333336 | 7.4 |
| 44311.78125 | 7.23 |
| 44311.791666666664 | 6.84 |
| 44311.802083333336 | 6.44 |
| 44311.8125 | 5.81 |
| 44311.822916666664 | 5.09 |
| 44311.833333333336 | 4.61 |
| 44311.84375 | 4.33 |
| 44311.854166666664 | 3.9 |
| 44311.864583333336 | 3.85 |
| 44311.875 | 3.86 |
| 44311.885416666664 | 3.46 |
| 44311.895833333336 | 3.57 |
| 44311.90625 | 3.58 |
| 44311.916666666664 | 3.63 |
| 44311.927083333336 | 3.65 |
| 44311.9375 | 3.55 |
| 44311.947916666664 | 3.5 |
| 44311.958333333336 | 3.44 |
| 44311.96875 | 3.33 |
| 44311.979166666664 | 3.44 |
| 44311.989583333336 | 3.47 |
| 44312.0 | 3.72 |
| 44312.010416666664 | 3.77 |
| 44312.020833333336 | 4.02 |
| 44312.03125 | 4.58 |
| 44312.041666666664 | 4.34 |
| 44312.052083333336 | 4.16 |
| 44312.0625 | 4.03 |
| 44312.072916666664 | 3.6 |
| 44312.083333333336 | 3.81 |
| 44312.09375 | 3.62 |
| 44312.104166666664 | 3.46 |
| 44312.114583333336 | 3.58 |
| 44312.125 | 3.68 |
| 44312.135416666664 | 3.7 |
| 44312.145833333336 | 3.86 |
| 44312.15625 | 3.83 |
| 44312.166666666664 | 3.75 |
| 44312.177083333336 | 3.82 |
| 44312.1875 | 3.94 |
| 44312.197916666664 | 4.13 |
| 44312.208333333336 | 4.4 |
| 44312.21875 | 4.64 |
| 44312.229166666664 | 5.2 |
| 44312.239583333336 | 5.4 |
| 44312.25 | 5.98 |
| 44312.260416666664 | 6.34 |
| 44312.270833333336 | 6.57 |
| 44312.28125 | 6.65 |
| 44312.291666666664 | 8.87 |
| 44312.302083333336 | 7 |
| 44312.3125 | 6.52 |
| 44312.322916666664 | 6.58 |
| 44312.333333333336 | 6.07 |
| 44312.34375 | 5.4 |
| 44312.354166666664 | 4.82 |
| 44312.364583333336 | 4.45 |
| 44312.375 | 3.99 |
| 44312.385416666664 | 4.03 |
| 44312.395833333336 | 3.92 |
| 44312.40625 | 3.5 |
| 44312.416666666664 | 3.45 |
| 44312.427083333336 | 3.16 |
| 44312.4375 | 3.09 |
| 44312.447916666664 | 2.9 |
| 44312.458333333336 | 2.95 |
| 44312.46875 | 2.86 |
| 44312.479166666664 | 3.03 |
| 44312.489583333336 | 2.98 |
| 44312.5 | 2.86 |
| 44312.510416666664 | 2.71 |
| 44312.520833333336 | 2.77 |
| 44312.53125 | 2.37 |
| 44312.541666666664 | 2.28 |
| 44312.552083333336 | 2.47 |
| 44312.5625 | 2.27 |
| 44312.572916666664 | 2.35 |
| 44312.583333333336 | 2.35 |
| 44312.59375 | 2.27 |
| 44312.604166666664 | 2.12 |
| 44312.614583333336 | 2.02 |
| 44312.625 | 2.44 |
| 44312.635416666664 | 2.27 |
| 44312.645833333336 | 2.39 |
| 44312.65625 | 2.72 |
| 44312.666666666664 | 2.99 |
| 44312.677083333336 | 2.76 |
| 44312.6875 | 3 |
| 44312.697916666664 | 2.9 |
| 44312.708333333336 | 3.29 |
| 44312.71875 | 3.44 |
| 44312.729166666664 | 3.66 |
| 44312.739583333336 | 4.41 |
| 44312.75 | 5.05 |
| 44312.760416666664 | 5.45 |
| 44312.770833333336 | 5.18 |
| 44312.78125 | 6.62 |
| 44312.791666666664 | 4.73 |
| 44312.802083333336 | 5.51 |
| 44312.8125 | 6.32 |
| 44312.822916666664 | 5.73 |
| 44312.833333333336 | 5.6 |
| 44312.84375 | 5.17 |
| 44312.854166666664 | 4.57 |
| 44312.864583333336 | 4.7 |
| 44312.875 | 4.52 |
| 44312.885416666664 | 4.49 |
| 44312.895833333336 | 4.05 |
| 44312.90625 | 3.96 |
| 44312.916666666664 | 3.82 |
| 44312.927083333336 | 4.24 |
| 44312.9375 | 4.31 |
| 44312.947916666664 | 4.03 |
| 44312.958333333336 | 4.05 |
| 44312.96875 | 3.94 |
| 44312.979166666664 | 3.82 |
| 44312.989583333336 | 3.73 |
| 44313.0 | 3.81 |
| 44313.010416666664 | 3.87 |
| 44313.020833333336 | 4.22 |
| 44313.03125 | 3.93 |
| 44313.041666666664 | 4.04 |
| 44313.052083333336 | 4.2 |
| 44313.0625 | 4.13 |
| 44313.072916666664 | 4.03 |
| 44313.083333333336 | 4.2 |
| 44313.09375 | 3.88 |
| 44313.104166666664 | 3.94 |
| 44313.114583333336 | 3.57 |
| 44313.125 | 3.92 |
| 44313.135416666664 | 3.78 |
| 44313.145833333336 | 3.45 |
| 44313.15625 | 3.35 |
| 44313.166666666664 | 3.42 |
| 44313.177083333336 | 3.56 |
| 44313.1875 | 3.76 |
| 44313.197916666664 | 3.95 |
| 44313.208333333336 | 3.8 |
| 44313.21875 | 4.17 |
| 44313.229166666664 | 4.05 |
| 44313.239583333336 | 4.58 |
| 44313.25 | 4.63 |
| 44313.260416666664 | 4.69 |
| 44313.270833333336 | 5.14 |
| 44313.28125 | 5.67 |
| 44313.291666666664 | 5.96 |
| 44313.302083333336 | 6.46 |
| 44313.3125 | 6.34 |
| 44313.322916666664 | 7.41 |
| 44313.333333333336 | 5.83 |
| 44313.34375 | 6.37 |
| 44313.354166666664 | 6.25 |
| 44313.364583333336 | 5.84 |
| 44313.375 | 5.41 |
| 44313.385416666664 | 5.03 |
| 44313.395833333336 | 4.67 |
| 44313.40625 | 4.08 |
| 44313.416666666664 | 4.11 |
| 44313.427083333336 | 3.64 |
| 44313.4375 | 3.8 |
| 44313.447916666664 | 3.68 |
| 44313.458333333336 | 3.68 |
| 44313.46875 | 3.42 |
| 44313.479166666664 | 3.13 |
| 44313.489583333336 | 3.08 |
| 44313.5 | 3 |
| 44313.510416666664 | 3.32 |
| 44313.520833333336 | 3.1 |
| 44313.53125 | 2.91 |
| 44313.541666666664 | 2.71 |
| 44313.552083333336 | 2.5 |
| 44313.5625 | 2.46 |
| 44313.572916666664 | 2.47 |
| 44313.583333333336 | 2.84 |
| 44313.59375 | 2.53 |
| 44313.604166666664 | 2.4 |
| 44313.614583333336 | 2.29 |
| 44313.625 | 2.45 |
| 44313.635416666664 | 2.22 |
| 44313.645833333336 | 2.38 |
| 44313.65625 | 2.61 |
| 44313.666666666664 | 2.41 |
| 44313.677083333336 | 2.51 |
| 44313.6875 | 2.86 |
| 44313.697916666664 | 2.85 |
| 44313.708333333336 | 2.98 |
| 44313.71875 | 3.32 |
| 44313.729166666664 | 3.55 |
| 44313.739583333336 | 3.46 |
| 44313.75 | 3.87 |
| 44313.760416666664 | 4.52 |
| 44313.770833333336 | 4.49 |
| 44313.78125 | 5.72 |
| 44313.791666666664 | 6.02 |
| 44313.802083333336 | 6.54 |
| 44313.8125 | 6.93 |
| 44313.822916666664 | 7.15 |
| 44313.833333333336 | 6.19 |
| 44313.84375 | 6.89 |
| 44313.854166666664 | 6.75 |
| 44313.864583333336 | 6.41 |
| 44313.875 | 5.75 |
| 44313.885416666664 | 5.49 |
| 44313.895833333336 | 5.09 |
| 44313.90625 | 4.93 |
| 44313.916666666664 | 4.76 |
| 44313.927083333336 | 4.79 |
| 44313.9375 | 4.31 |
| 44313.947916666664 | 4.45 |
| 44313.958333333336 | 4.48 |
| 44313.96875 | 5.88 |
| 44313.979166666664 | 4.23 |
| 44313.989583333336 | 4.36 |
| 44314.0 | 4.22 |
| 44314.010416666664 | 4.15 |
| 44314.020833333336 | 4.27 |
| 44314.03125 | 4 |
| 44314.041666666664 | 4.06 |
| 44314.052083333336 | 4.07 |
| 44314.0625 | 3.8 |
| 44314.072916666664 | 4.07 |
| 44314.083333333336 | 3.77 |
| 44314.09375 | 4.37 |
| 44314.104166666664 | 3.88 |
| 44314.114583333336 | 4.8 |
| 44314.125 | 4.29 |
| 44314.135416666664 | 4.06 |
| 44314.145833333336 | 4.27 |
| 44314.15625 | 3.88 |
| 44314.166666666664 | 4.11 |
| 44314.177083333336 | 3.81 |
| 44314.1875 | 3.64 |
| 44314.197916666664 | 3.82 |
| 44314.208333333336 | 3.88 |
| 44314.21875 | 3.97 |
| 44314.229166666664 | 3.94 |
| 44314.239583333336 | 3.88 |
| 44314.25 | 4.04 |
| 44314.260416666664 | 4.26 |
| 44314.270833333336 | 4.3 |
| 44314.28125 | 4.65 |
| 44314.291666666664 | 4.87 |
| 44314.302083333336 | 5.02 |
| 44314.3125 | 5.17 |
| 44314.322916666664 | 5.5 |
| 44314.333333333336 | 5.64 |
| 44314.34375 | 5.91 |
| 44314.354166666664 | 6.28 |
| 44314.364583333336 | 5.14 |
| 44314.375 | 5.69 |
| 44314.385416666664 | 5.65 |
| 44314.395833333336 | 5.61 |
| 44314.40625 | 5.06 |
| 44314.416666666664 | 5.04 |
| 44314.427083333336 | 5.04 |
| 44314.4375 | 4.46 |
| 44314.447916666664 | 4.34 |
| 44314.458333333336 | 4.16 |
| 44314.46875 | 4.29 |
| 44314.479166666664 | 4.14 |
| 44314.489583333336 | 4.07 |
| 44314.5 | 3.97 |
| 44314.510416666664 | 4.36 |
| 44314.520833333336 | 4.2 |
| 44314.53125 | 4.2 |
| 44314.541666666664 | 3.98 |
| 44314.552083333336 | 4.06 |
| 44314.5625 | 3.89 |
| 44314.572916666664 | 3.93 |
| 44314.583333333336 | 3.75 |
| 44314.59375 | 3.57 |
| 44314.604166666664 | 3.57 |
| 44314.614583333336 | 3.34 |
| 44314.625 | 3.58 |
| 44314.635416666664 | 3.06 |
| 44314.645833333336 | 3.15 |
| 44314.65625 | 3.21 |
| 44314.666666666664 | 3.44 |
| 44314.677083333336 | 3.05 |
| 44314.6875 | 3.78 |
| 44314.697916666664 | 3.61 |
| 44314.708333333336 | 3.64 |
| 44314.71875 | 4.18 |
| 44314.729166666664 | 3.82 |
| 44314.739583333336 | 3.78 |
| 44314.75 | 4.52 |
| 44314.760416666664 | 4.07 |
| 44314.770833333336 | 4.67 |
| 44314.78125 | 4.14 |
| 44314.791666666664 | 4.37 |
| 44314.802083333336 | 5.07 |
| 44314.8125 | 5.21 |
| 44314.822916666664 | 5.85 |
| 44314.833333333336 | 6.21 |
| 44314.84375 | 6.22 |
| 44314.854166666664 | 6.57 |
| 44314.864583333336 | 6.22 |
| 44314.875 | 6.39 |
| 44314.885416666664 | 5.96 |
| 44314.895833333336 | 5.6 |
| 44314.90625 | 5.43 |
| 44314.916666666664 | 5.3 |
| 44314.927083333336 | 5.05 |
| 44314.9375 | 4.9 |
| 44314.947916666664 | 4.82 |
| 44314.958333333336 | 4.84 |
| 44314.96875 | 4.66 |
| 44314.979166666664 | 4.48 |
| 44314.989583333336 | 4.78 |
| 44315.0 | 4.39 |
| 44315.010416666664 | 4.72 |
| 44315.020833333336 | 4.38 |
| 44315.03125 | 4.1 |
| 44315.041666666664 | 4.1 |
| 44315.052083333336 | 4.4 |
| 44315.0625 | 4.41 |
| 44315.072916666664 | 4.22 |
| 44315.083333333336 | 4.05 |
| 44315.09375 | 4.3 |
| 44315.104166666664 | 3.92 |
| 44315.114583333336 | 4.14 |
| 44315.125 | 4.04 |
| 44315.135416666664 | 4.76 |
| 44315.145833333336 | 4.23 |
| 44315.15625 | 4.02 |
| 44315.166666666664 | 3.77 |
| 44315.177083333336 | 3.68 |
| 44315.1875 | 3.6 |
| 44315.197916666664 | 4.08 |
| 44315.208333333336 | 3.64 |
| 44315.21875 | 3.92 |
| 44315.229166666664 | 3.43 |
| 44315.239583333336 | 3.9 |
| 44315.25 | 3.63 |
| 44315.260416666664 | 3.79 |
| 44315.270833333336 | 3.73 |
| 44315.28125 | 3.81 |
| 44315.291666666664 | 4.06 |
| 44315.302083333336 | 4.05 |
| 44315.3125 | 4.13 |
| 44315.322916666664 | 4.39 |
| 44315.333333333336 | 4.42 |
| 44315.34375 | 4.38 |
| 44315.354166666664 | 4.75 |
| 44315.364583333336 | 4.88 |
| 44315.375 | 5.05 |
| 44315.385416666664 | 5.32 |
| 44315.395833333336 | 5.5 |
| 44315.40625 | 5.02 |
| 44315.416666666664 | 5.34 |
| 44315.427083333336 | 5.05 |
| 44315.4375 | 4.53 |
| 44315.447916666664 | 4.2 |
| 44315.458333333336 | 4.28 |
| 44315.46875 | 4.2 |
| 44315.479166666664 | 4.04 |
| 44315.489583333336 | 3.9 |
| 44315.5 | 4.01 |
| 44315.510416666664 | 4.05 |
| 44315.520833333336 | 4.01 |
| 44315.53125 | 3.98 |
| 44315.541666666664 | 3.92 |
| 44315.552083333336 | 3.98 |
| 44315.5625 | 4.09 |
| 44315.572916666664 | 3.6 |
| 44315.583333333336 | 3.45 |
| 44315.59375 | 3.59 |
| 44315.604166666664 | 3.29 |
| 44315.614583333336 | 3.35 |
| 44315.625 | 3.36 |
| 44315.635416666664 | 2.99 |
| 44315.645833333336 | 3.16 |
| 44315.65625 | 3.45 |
| 44315.666666666664 | 2.95 |
| 44315.677083333336 | 3.15 |
| 44315.6875 | 2.88 |
| 44315.697916666664 | 3.1 |
| 44315.708333333336 | 3.11 |
| 44315.71875 | 3.4 |
| 44315.729166666664 | 3.15 |
| 44315.739583333336 | 3.52 |
| 44315.75 | 3.5 |
| 44315.760416666664 | 3.61 |
| 44315.770833333336 | 3.63 |
| 44315.78125 | 3.72 |
| 44315.791666666664 | 4.1 |
| 44315.802083333336 | 4.56 |
| 44315.8125 | 4.86 |
| 44315.822916666664 | 5.24 |
| 44315.833333333336 | 5.32 |
| 44315.84375 | 5.4 |
| 44315.854166666664 | 5.28 |
| 44315.864583333336 | 5.65 |
| 44315.875 | 6.14 |
| 44315.885416666664 | 6.03 |
| 44315.895833333336 | 6.73 |
| 44315.90625 | 6.8 |
| 44315.916666666664 | 5.82 |
| 44315.927083333336 | 5.17 |
| 44315.9375 | 5.22 |
| 44315.947916666664 | 5.29 |
| 44315.958333333336 | 5.34 |
| 44315.96875 | 5.55 |
| 44315.979166666664 | 5.63 |
| 44315.989583333336 | 5.63 |
| 44316.0 | 5.69 |
| 44316.010416666664 | 5.65 |
| 44316.020833333336 | 5.59 |
| 44316.03125 | 5.15 |
| 44316.041666666664 | 5.01 |
| 44316.052083333336 | 4.71 |
| 44316.0625 | 4.58 |
| 44316.072916666664 | 4.35 |
| 44316.083333333336 | 4.77 |
| 44316.09375 | 4.24 |
| 44316.104166666664 | 4.35 |
| 44316.114583333336 | 4.01 |
| 44316.125 | 4.14 |
| 44316.135416666664 | 4.16 |
| 44316.145833333336 | 3.92 |
| 44316.15625 | 3.94 |
| 44316.166666666664 | 3.67 |
| 44316.177083333336 | 3.74 |
| 44316.1875 | 3.73 |
| 44316.197916666664 | 4.05 |
| 44316.208333333336 | 3.8 |
| 44316.21875 | 3.78 |
| 44316.229166666664 | 3.67 |
| 44316.239583333336 | 4 |
| 44316.25 | 3.69 |
| 44316.260416666664 | 3.79 |
| 44316.270833333336 | 3.79 |
| 44316.28125 | 3.83 |
| 44316.291666666664 | 3.64 |
| 44316.302083333336 | 4.11 |
| 44316.3125 | 3.8 |
| 44316.322916666664 | 3.94 |
| 44316.333333333336 | 4.24 |
| 44316.34375 | 4.32 |
| 44316.354166666664 | 4.48 |
| 44316.364583333336 | 4.4 |
| 44316.375 | 4.86 |
| 44316.385416666664 | 4.99 |
| 44316.395833333336 | 5.12 |
| 44316.40625 | 5.46 |
| 44316.416666666664 | 6.13 |
| 44316.427083333336 | 5.7 |
| 44316.4375 | 6.07 |
| 44316.447916666664 | 5.27 |
| 44316.458333333336 | 5.37 |
| 44316.46875 | 5.33 |
| 44316.479166666664 | 5.03 |
| 44316.489583333336 | 4.97 |
| 44316.5 | 4.89 |
| 44316.510416666664 | 4.63 |
| 44316.520833333336 | 4.37 |
| 44316.53125 | 4.36 |
| 44316.541666666664 | 4.01 |
| 44316.552083333336 | 3.97 |
| 44316.5625 | 3.89 |
| 44316.572916666664 | 4.05 |
| 44316.583333333336 | 3.89 |
| 44316.59375 | 3.64 |
| 44316.604166666664 | 3.48 |
| 44316.614583333336 | 3.78 |
| 44316.625 | 3.89 |
| 44316.635416666664 | 3.66 |
| 44316.645833333336 | 3.8 |
| 44316.65625 | 3.72 |
| 44316.666666666664 | 3.39 |
| 44316.677083333336 | 3.43 |
| 44316.6875 | 3.77 |
| 44316.697916666664 | 3.66 |
| 44316.708333333336 | 3.81 |
| 44316.71875 | 3.55 |
| 44316.729166666664 | 4.2 |
| 44316.739583333336 | 3.88 |
| 44316.75 | 3.68 |
| 44316.760416666664 | 4.03 |
| 44316.770833333336 | 3.87 |
| 44316.78125 | 3.81 |
| 44316.791666666664 | 4.13 |
| 44316.802083333336 | 4.37 |
| 44316.8125 | 4.31 |
| 44316.822916666664 | 4.66 |
| 44316.833333333336 | 4.85 |
| 44316.84375 | 5.1 |
| 44316.854166666664 | 4.9 |
| 44316.864583333336 | 5.69 |
| 44316.875 | 5.91 |
| 44316.885416666664 | 6.38 |
| 44316.895833333336 | 6.71 |
| 44316.90625 | 6.48 |
| 44316.916666666664 | 6.41 |
| 44316.927083333336 | 6.78 |
| 44316.9375 | 6.23 |
| 44316.947916666664 | 6.78 |
| 44316.958333333336 | 7.04 |
| 44316.96875 | 5.97 |
| 44316.979166666664 | 6.17 |
| 44316.989583333336 | 5.73 |
| 44317.0 | 5.58 |
| 44317.010416666664 | 5.58 |
| 44317.020833333336 | 5.93 |
| 44317.03125 | 5.35 |
| 44317.041666666664 | 5.1 |
| 44317.052083333336 | 5.66 |
| 44317.0625 | 5.26 |
| 44317.072916666664 | 5.01 |
| 44317.083333333336 | 5.49 |
| 44317.09375 | 5.67 |
| 44317.104166666664 | 5.76 |
| 44317.114583333336 | 5.52 |
| 44317.125 | 5.73 |
| 44317.135416666664 | 5.44 |
| 44317.145833333336 | 5.34 |
| 44317.15625 | 5.1 |